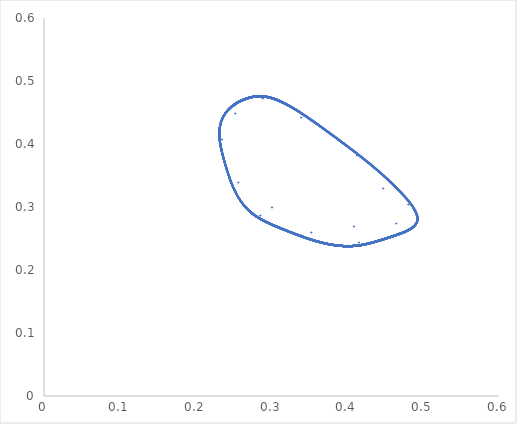
| Category | Series 0 |
|---|---|
| 0.3 | 0.3 |
| 0.408 | 0.27 |
| 0.4466784000000001 | 0.33 |
| 0.3384309997608959 | 0.443 |
| 0.2516668246737154 | 0.45 |
| 0.2555927256868969 | 0.339 |
| 0.3518976219225561 | 0.26 |
| 0.4639900670035131 | 0.275 |
| 0.412085344887821 | 0.383 |
| 0.28779725564910913 | 0.473 |
| 0.23418545066039678 | 0.408 |
| 0.28468329679281196 | 0.287 |
| 0.4147357089099985 | 0.245 |
| 0.4798453995458387 | 0.305 |
| 0.35135039913136556 | 0.439 |
| 0.2507247554830299 | 0.462 |
| 0.24448082575778693 | 0.348 |
| 0.33885452554210405 | 0.255 |
| 0.46776044034405506 | 0.259 |
| 0.4339731850717641 | 0.364 |
| 0.2981450010214707 | 0.474 |
| 0.23112478068429274 | 0.424 |
| 0.27114486434297075 | 0.294 |
| 0.4010068952705898 | 0.239 |
| 0.49075982054262485 | 0.288 |
| 0.369862290358846 | 0.423 |
| 0.25998580892242457 | 0.47 |
| 0.23886224164842962 | 0.366 |
| 0.3205637779438777 | 0.263 |
| 0.45434862250992986 | 0.253 |
| 0.4528372774387154 | 0.344 |
| 0.3125131402679152 | 0.468 |
| 0.23366070986730772 | 0.438 |
| 0.2605501988998789 | 0.307 |
| 0.3828351144710521 | 0.24 |
| 0.4906779546914901 | 0.276 |
| 0.3894758445022503 | 0.406 |
| 0.27072312014614286 | 0.474 |
| 0.23453008102804954 | 0.385 |
| 0.3031020849666783 | 0.271 |
| 0.4387696083859256 | 0.247 |
| 0.4694544361269472 | 0.325 |
| 0.32883389766915255 | 0.457 |
| 0.23938560634832237 | 0.451 |
| 0.25209307293817873 | 0.324 |
| 0.3635044380830901 | 0.245 |
| 0.4839946138672994 | 0.267 |
| 0.4096717942106105 | 0.388 |
| 0.28215908881741564 | 0.477 |
| 0.23147204393836693 | 0.403 |
| 0.28736067747542204 | 0.28 |
| 0.42257819067260705 | 0.241 |
| 0.4826547100077935 | 0.306 |
| 0.3465838779469759 | 0.443 |
| 0.24761172613914673 | 0.461 |
| 0.2453900734821034 | 0.342 |
| 0.3439343950205124 | 0.252 |
| 0.4724467308011112 | 0.26 |
| 0.4296701437162127 | 0.369 |
| 0.29470026997704285 | 0.475 |
| 0.23062419046107321 | 0.42 |
| 0.2739030594202963 | 0.291 |
| 0.40553668158965145 | 0.239 |
| 0.4903780204516413 | 0.291 |
| 0.36526622880386134 | 0.427 |
| 0.2574534633441935 | 0.468 |
| 0.2399932638556005 | 0.362 |
| 0.3249644828907604 | 0.26 |
| 0.458060165290946 | 0.254 |
| 0.4485681247467065 | 0.349 |
| 0.3088454506194812 | 0.47 |
| 0.23269751858967294 | 0.435 |
| 0.2628620100584735 | 0.304 |
| 0.38736699146524084 | 0.24 |
| 0.4914309456426156 | 0.278 |
| 0.3847053179308661 | 0.41 |
| 0.2680883813504671 | 0.474 |
| 0.2354759276895789 | 0.381 |
| 0.30715390935375275 | 0.269 |
| 0.4425666669082542 | 0.248 |
| 0.465716179885406 | 0.329 |
| 0.3247714268165605 | 0.46 |
| 0.23775876635345672 | 0.448 |
| 0.25394729299491337 | 0.32 |
| 0.3681930559576184 | 0.243 |
| 0.4861070701963344 | 0.269 |
| 0.404811734668896 | 0.392 |
| 0.2793379263756787 | 0.476 |
| 0.2320418391116009 | 0.399 |
| 0.2909431357875018 | 0.278 |
| 0.4265222939695723 | 0.243 |
| 0.47991425306738167 | 0.31 |
| 0.3422286901413084 | 0.447 |
| 0.2454544875839503 | 0.459 |
| 0.2468571186857455 | 0.338 |
| 0.34859928385873995 | 0.25 |
| 0.4755555642254959 | 0.262 |
| 0.4249488329168767 | 0.373 |
| 0.291563886345551 | 0.476 |
| 0.23057681449506146 | 0.416 |
| 0.2769030471888592 | 0.288 |
| 0.40971823157012743 | 0.239 |
| 0.48911738876295063 | 0.294 |
| 0.360719760757462 | 0.431 |
| 0.255000047260184 | 0.467 |
| 0.24119679997946974 | 0.357 |
| 0.3294208112536228 | 0.258 |
| 0.46165640539793834 | 0.255 |
| 0.44417324008085507 | 0.354 |
| 0.30529228842900047 | 0.471 |
| 0.23192221132609928 | 0.432 |
| 0.2653014447829947 | 0.3 |
| 0.39182624274696787 | 0.239 |
| 0.49178907270600386 | 0.281 |
| 0.37997605709110854 | 0.415 |
| 0.265488227789007 | 0.473 |
| 0.2364818672928516 | 0.376 |
| 0.31129624522935606 | 0.267 |
| 0.4463327977616989 | 0.249 |
| 0.4618115178498293 | 0.334 |
| 0.32079880828127627 | 0.463 |
| 0.23628620696444655 | 0.445 |
| 0.2559071304657914 | 0.316 |
| 0.3728556109808632 | 0.242 |
| 0.48791412135486095 | 0.271 |
| 0.39995513339910516 | 0.397 |
| 0.276572112377158 | 0.476 |
| 0.23272511737911983 | 0.395 |
| 0.29465191360899334 | 0.276 |
| 0.4304231062088804 | 0.244 |
| 0.47688413442297256 | 0.315 |
| 0.33793153169172196 | 0.45 |
| 0.2434045424794303 | 0.456 |
| 0.24840731025264515 | 0.333 |
| 0.3532892510604819 | 0.248 |
| 0.4784712528277246 | 0.263 |
| 0.4201727585256485 | 0.378 |
| 0.28851518078587074 | 0.476 |
| 0.23069451416088063 | 0.412 |
| 0.28004598751610565 | 0.285 |
| 0.4138354771146103 | 0.24 |
| 0.48747312964861317 | 0.298 |
| 0.35621556059121695 | 0.435 |
| 0.2525975782001791 | 0.465 |
| 0.24245210051270213 | 0.352 |
| 0.3339390572401689 | 0.256 |
| 0.46517702876518985 | 0.257 |
| 0.4396884921597246 | 0.358 |
| 0.30184330255816844 | 0.473 |
| 0.23132212878644842 | 0.428 |
| 0.2678675856624555 | 0.297 |
| 0.39622129762309255 | 0.239 |
| 0.4917673495755245 | 0.284 |
| 0.3752909027568115 | 0.419 |
| 0.26291940901232924 | 0.471 |
| 0.2375388250102545 | 0.372 |
| 0.315522340850996 | 0.265 |
| 0.4500695611999221 | 0.251 |
| 0.4577651404543287 | 0.339 |
| 0.316921353988557 | 0.465 |
| 0.23497374723169043 | 0.442 |
| 0.2579757891858659 | 0.312 |
| 0.37748219997403265 | 0.241 |
| 0.4893979149831432 | 0.273 |
| 0.3951149512785508 | 0.401 |
| 0.2738543870403149 | 0.475 |
| 0.23350664089734036 | 0.391 |
| 0.29847848461400545 | 0.274 |
| 0.43428603175662644 | 0.245 |
| 0.4735962931818137 | 0.319 |
| 0.3336999283145049 | 0.453 |
| 0.24147561855189478 | 0.454 |
| 0.25004752821479204 | 0.329 |
| 0.3579921754561107 | 0.247 |
| 0.48116323504643244 | 0.265 |
| 0.4153546225075041 | 0.382 |
| 0.28554689638749076 | 0.477 |
| 0.23096820752949465 | 0.408 |
| 0.2833314903205086 | 0.283 |
| 0.4178924372831076 | 0.24 |
| 0.4854591689693709 | 0.301 |
| 0.3517545781424127 | 0.439 |
| 0.2502574878136701 | 0.463 |
| 0.24376565765255062 | 0.348 |
| 0.3385127921669486 | 0.254 |
| 0.46859867905128755 | 0.258 |
| 0.435120740592847 | 0.363 |
| 0.29849689291313414 | 0.474 |
| 0.23089817897345283 | 0.424 |
| 0.27056566654808906 | 0.294 |
| 0.4005494150178268 | 0.239 |
| 0.4913577286941175 | 0.287 |
| 0.37065038655563304 | 0.423 |
| 0.2603825161647846 | 0.47 |
| 0.23864226412899117 | 0.367 |
| 0.3198264025731898 | 0.263 |
| 0.45377279371139273 | 0.252 |
| 0.45359520503409895 | 0.343 |
| 0.3131434663441369 | 0.467 |
| 0.23382652617623656 | 0.439 |
| 0.2601568203153708 | 0.308 |
| 0.3820637352324987 | 0.24 |
| 0.4905419318178488 | 0.275 |
| 0.390301966743441 | 0.405 |
| 0.2711785493651791 | 0.475 |
| 0.23437199927404567 | 0.386 |
| 0.3024138502064652 | 0.271 |
| 0.43811554984957796 | 0.246 |
| 0.4700825209469463 | 0.324 |
| 0.3295418464102805 | 0.457 |
| 0.23968001228183872 | 0.451 |
| 0.251783616281448 | 0.325 |
| 0.36269551102360864 | 0.245 |
| 0.48360288925872164 | 0.267 |
| 0.4105085254008296 | 0.387 |
| 0.28265113584945084 | 0.477 |
| 0.23138628404811662 | 0.404 |
| 0.28675676257693367 | 0.281 |
| 0.4218941114131488 | 0.241 |
| 0.48309562132238 | 0.305 |
| 0.34733954673316747 | 0.443 |
| 0.2479931120515237 | 0.461 |
| 0.24514514375087987 | 0.343 |
| 0.34313410771736574 | 0.252 |
| 0.471893992335971 | 0.26 |
| 0.4304772092250973 | 0.368 |
| 0.2952499323402746 | 0.475 |
| 0.2306495114291169 | 0.421 |
| 0.2734005403456522 | 0.291 |
| 0.4048095744681369 | 0.239 |
| 0.49055584644234107 | 0.29 |
| 0.3660537909969593 | 0.427 |
| 0.25788059183331413 | 0.469 |
| 0.23979077110878058 | 0.363 |
| 0.3242033885665147 | 0.261 |
| 0.4574343953899824 | 0.254 |
| 0.4493156747615447 | 0.348 |
| 0.30946814941551715 | 0.469 |
| 0.23284864124205354 | 0.436 |
| 0.2624541541616523 | 0.304 |
| 0.3865925526370939 | 0.24 |
| 0.4913316374152372 | 0.278 |
| 0.38552439423093326 | 0.41 |
| 0.268539590372972 | 0.474 |
| 0.2353082832899045 | 0.382 |
| 0.3064491973339357 | 0.269 |
| 0.4419149764499867 | 0.248 |
| 0.4663729924687215 | 0.328 |
| 0.3254650510208979 | 0.459 |
| 0.2380281786823699 | 0.449 |
| 0.25362038170877693 | 0.32 |
| 0.36738688799693625 | 0.244 |
| 0.48576445086383885 | 0.269 |
| 0.4056491862417289 | 0.391 |
| 0.27981979597855394 | 0.476 |
| 0.23193514577450905 | 0.4 |
| 0.29031670761907163 | 0.278 |
| 0.42584604905578166 | 0.242 |
| 0.4804079267066945 | 0.31 |
| 0.3429750731393446 | 0.446 |
| 0.2458188895419321 | 0.459 |
| 0.2465986482664254 | 0.339 |
| 0.3477934903103921 | 0.25 |
| 0.4750328704712012 | 0.261 |
| 0.4257664666462856 | 0.372 |
| 0.2920977913946692 | 0.476 |
| 0.2305729945633767 | 0.417 |
| 0.2763760320106652 | 0.288 |
| 0.4090025005205697 | 0.239 |
| 0.48936221823056714 | 0.293 |
| 0.3615000286691148 | 0.431 |
| 0.25541937983184254 | 0.467 |
| 0.24098591599773633 | 0.358 |
| 0.32864848719977213 | 0.259 |
| 0.4610416451872665 | 0.255 |
| 0.44493700847053114 | 0.353 |
| 0.30589698814675703 | 0.471 |
| 0.23204333665893012 | 0.432 |
| 0.26487228338951563 | 0.301 |
| 0.39106246531175165 | 0.239 |
| 0.49175418842377683 | 0.28 |
| 0.38078772482006457 | 0.414 |
| 0.26593393831211465 | 0.473 |
| 0.23630474995123 | 0.377 |
| 0.3105764426914663 | 0.267 |
| 0.44568598733533454 | 0.249 |
| 0.46249490176178526 | 0.333 |
| 0.32147658090532105 | 0.462 |
| 0.23652865054148803 | 0.446 |
| 0.25556182098814484 | 0.316 |
| 0.37205462254728167 | 0.242 |
| 0.4876253506581168 | 0.271 |
| 0.400791007861758 | 0.396 |
| 0.2770449977418507 | 0.476 |
| 0.23259997832874585 | 0.396 |
| 0.29400430842093844 | 0.276 |
| 0.42975390250641204 | 0.244 |
| 0.47742544291426003 | 0.314 |
| 0.3386674039245774 | 0.45 |
| 0.24374945192781453 | 0.457 |
| 0.24813399905710834 | 0.334 |
| 0.35247997902883066 | 0.249 |
| 0.4779840458967182 | 0.263 |
| 0.4209989690206218 | 0.377 |
| 0.28903447414170536 | 0.476 |
| 0.23066282672684119 | 0.413 |
| 0.2794943065181793 | 0.286 |
| 0.41313057083726734 | 0.24 |
| 0.4877832370664043 | 0.297 |
| 0.3569885237797014 | 0.435 |
| 0.2530073816863911 | 0.465 |
| 0.24223188005874718 | 0.353 |
| 0.33315648758063143 | 0.257 |
| 0.46457683460618193 | 0.257 |
| 0.44046724534819176 | 0.358 |
| 0.3024301264152882 | 0.473 |
| 0.2314129603134553 | 0.429 |
| 0.2674162202315003 | 0.298 |
| 0.3954688223527438 | 0.239 |
| 0.49179856555496443 | 0.283 |
| 0.3760948866270867 | 0.418 |
| 0.26335974231336345 | 0.472 |
| 0.23735332848328128 | 0.373 |
| 0.31478854800002987 | 0.265 |
| 0.44942800952730366 | 0.251 |
| 0.4584715222238514 | 0.338 |
| 0.31758237919585436 | 0.465 |
| 0.23518820837364557 | 0.443 |
| 0.2576114844653053 | 0.312 |
| 0.376688094410552 | 0.241 |
| 0.4891660765587024 | 0.273 |
| 0.3959471624940304 | 0.4 |
| 0.2743194593126028 | 0.475 |
| 0.23336563372378638 | 0.391 |
| 0.2978112225657388 | 0.274 |
| 0.43362300976526275 | 0.245 |
| 0.4741797150766892 | 0.318 |
| 0.3344239420606182 | 0.453 |
| 0.24179875409495186 | 0.454 |
| 0.24975825989559455 | 0.33 |
| 0.35718156192234657 | 0.247 |
| 0.48071667904510623 | 0.265 |
| 0.4161871046297308 | 0.382 |
| 0.2860528850970187 | 0.477 |
| 0.230910407662772 | 0.409 |
| 0.2827553799711845 | 0.283 |
| 0.4171975828842945 | 0.24 |
| 0.4858317005897444 | 0.301 |
| 0.35251995350694065 | 0.438 |
| 0.2506556375048489 | 0.464 |
| 0.24353487653906508 | 0.349 |
| 0.33772118215916824 | 0.255 |
| 0.46801738961249073 | 0.258 |
| 0.4359133035269886 | 0.362 |
| 0.29906622487720796 | 0.474 |
| 0.2309586705310063 | 0.425 |
| 0.2700912055392229 | 0.295 |
| 0.399808593451067 | 0.239 |
| 0.49145620200565654 | 0.286 |
| 0.3714467071552664 | 0.422 |
| 0.2608172044768977 | 0.47 |
| 0.23844894697317429 | 0.368 |
| 0.31907955225945817 | 0.263 |
| 0.45313747681378963 | 0.252 |
| 0.45432176749779857 | 0.343 |
| 0.3137870843784553 | 0.467 |
| 0.2340122018175233 | 0.439 |
| 0.25977288950303845 | 0.309 |
| 0.3812779785668302 | 0.24 |
| 0.4903697171305539 | 0.275 |
| 0.39112883135295334 | 0.405 |
| 0.27163679846752004 | 0.475 |
| 0.23421752032812293 | 0.387 |
| 0.30172848621497617 | 0.272 |
| 0.4374580090888158 | 0.246 |
| 0.47070265095653735 | 0.323 |
| 0.33025262695303853 | 0.456 |
| 0.23997938008756448 | 0.452 |
| 0.2514774614083825 | 0.325 |
| 0.36188572063040153 | 0.245 |
| 0.48320172893494096 | 0.266 |
| 0.4113447809400602 | 0.386 |
| 0.28314520765038614 | 0.477 |
| 0.23130453246261265 | 0.405 |
| 0.286156874999424 | 0.281 |
| 0.4212083957082331 | 0.241 |
| 0.4835266998310653 | 0.305 |
| 0.34809672793407076 | 0.442 |
| 0.24837720728229842 | 0.462 |
| 0.2449024296607858 | 0.344 |
| 0.342334934470055 | 0.253 |
| 0.47133655738903996 | 0.26 |
| 0.4312822638606502 | 0.367 |
| 0.29580242016739405 | 0.475 |
| 0.23067995848471726 | 0.421 |
| 0.2729022024081481 | 0.292 |
| 0.4040804574410254 | 0.239 |
| 0.4907220135017007 | 0.289 |
| 0.3668426236298652 | 0.426 |
| 0.2583089234407624 | 0.469 |
| 0.2395896572342336 | 0.363 |
| 0.3234443163626163 | 0.261 |
| 0.4568070221029084 | 0.253 |
| 0.450060287209393 | 0.347 |
| 0.31009394354067643 | 0.469 |
| 0.23300488894506544 | 0.436 |
| 0.26204988253327477 | 0.305 |
| 0.3858163612631242 | 0.24 |
| 0.4912214263464763 | 0.277 |
| 0.3863446908373554 | 0.409 |
| 0.2689917839422417 | 0.474 |
| 0.23514241877732137 | 0.382 |
| 0.30574721037615366 | 0.27 |
| 0.44126244782856794 | 0.247 |
| 0.46702481138691165 | 0.328 |
| 0.3261612995436605 | 0.459 |
| 0.23830211593464268 | 0.449 |
| 0.2532965783891608 | 0.321 |
| 0.3665800156747216 | 0.244 |
| 0.48541289997537584 | 0.268 |
| 0.4064866752705094 | 0.391 |
| 0.2803033423637438 | 0.476 |
| 0.23183189542199908 | 0.401 |
| 0.28969407167198236 | 0.279 |
| 0.4251684964215117 | 0.242 |
| 0.4808928452993853 | 0.309 |
| 0.3437231393535317 | 0.446 |
| 0.246186403348298 | 0.46 |
| 0.24634260907187666 | 0.339 |
| 0.34698850388013236 | 0.251 |
| 0.4745046043289046 | 0.261 |
| 0.42658241101818684 | 0.372 |
| 0.292634335533663 | 0.476 |
| 0.2305741189309441 | 0.418 |
| 0.2758532600679798 | 0.289 |
| 0.40828484101112106 | 0.239 |
| 0.4895955942923556 | 0.293 |
| 0.36228154774864635 | 0.43 |
| 0.25584016694887246 | 0.467 |
| 0.2407765354776817 | 0.359 |
| 0.32787803260588544 | 0.259 |
| 0.46042475798595767 | 0.255 |
| 0.44569807566258546 | 0.352 |
| 0.3065047871817033 | 0.471 |
| 0.2321696569033623 | 0.433 |
| 0.2644468555249377 | 0.301 |
| 0.3902967975684969 | 0.239 |
| 0.49170807365237923 | 0.28 |
| 0.381600698644301 | 0.413 |
| 0.26638057757485106 | 0.473 |
| 0.23612917210266485 | 0.378 |
| 0.3098591562376774 | 0.268 |
| 0.445038323642785 | 0.249 |
| 0.46317398393094666 | 0.332 |
| 0.3221571547209518 | 0.462 |
| 0.23677581945646542 | 0.446 |
| 0.2552197238212548 | 0.317 |
| 0.37125261400158627 | 0.243 |
| 0.4873270704768902 | 0.27 |
| 0.40162731260748225 | 0.395 |
| 0.27751934303113596 | 0.476 |
| 0.23247783048321136 | 0.396 |
| 0.29336024611132183 | 0.276 |
| 0.42908355044088065 | 0.243 |
| 0.47795893711655996 | 0.313 |
| 0.3394051806317523 | 0.449 |
| 0.24409788911980815 | 0.457 |
| 0.24786332939827094 | 0.335 |
| 0.3516711562415631 | 0.249 |
| 0.4774903478635081 | 0.263 |
| 0.4218238588918033 | 0.376 |
| 0.2895561950572541 | 0.476 |
| 0.23063582785356504 | 0.414 |
| 0.2789468698374146 | 0.286 |
| 0.41242384969143037 | 0.24 |
| 0.48808227119101644 | 0.296 |
| 0.35776275706088595 | 0.434 |
| 0.2534189686655786 | 0.466 |
| 0.24201334924687076 | 0.354 |
| 0.33237560419997064 | 0.257 |
| 0.46397384176157136 | 0.256 |
| 0.4412434995226284 | 0.357 |
| 0.3030200099512591 | 0.472 |
| 0.23150902232342413 | 0.429 |
| 0.26696874512880114 | 0.298 |
| 0.39471436659934406 | 0.239 |
| 0.4918182942195645 | 0.283 |
| 0.376900199419343 | 0.417 |
| 0.26380100950061675 | 0.472 |
| 0.23716922060025272 | 0.373 |
| 0.31405709493202344 | 0.266 |
| 0.44878550072650897 | 0.25 |
| 0.45917416339862616 | 0.337 |
| 0.3182463434590064 | 0.464 |
| 0.23540755277863912 | 0.443 |
| 0.25725049555596985 | 0.313 |
| 0.3758926916963489 | 0.242 |
| 0.4889242280667688 | 0.272 |
| 0.3967801371166067 | 0.4 |
| 0.274785801487212 | 0.476 |
| 0.2332271826804883 | 0.392 |
| 0.29714723562866485 | 0.274 |
| 0.4329589779984795 | 0.245 |
| 0.4747562739067616 | 0.318 |
| 0.3351500974912075 | 0.452 |
| 0.24212579192885533 | 0.455 |
| 0.24947181215523284 | 0.33 |
| 0.35637102463308923 | 0.247 |
| 0.4802627676607248 | 0.264 |
| 0.4170186807740337 | 0.381 |
| 0.2865610682852051 | 0.476 |
| 0.23085696254507204 | 0.41 |
| 0.2821834432502894 | 0.284 |
| 0.4165010589010216 | 0.24 |
| 0.48619372745957046 | 0.3 |
| 0.3532866701406544 | 0.438 |
| 0.25105596020872123 | 0.464 |
| 0.24330601027079157 | 0.349 |
| 0.336931032198975 | 0.255 |
| 0.467432504492283 | 0.258 |
| 0.43670357506119856 | 0.361 |
| 0.29963853152396536 | 0.474 |
| 0.2310243787921228 | 0.426 |
| 0.26962078373720955 | 0.295 |
| 0.3990657520742059 | 0.239 |
| 0.4915430341206119 | 0.286 |
| 0.37224433785590927 | 0.421 |
| 0.26125290311697114 | 0.471 |
| 0.2382569608707757 | 0.369 |
| 0.31833489040431356 | 0.264 |
| 0.45250098591461696 | 0.252 |
| 0.4550450226980364 | 0.342 |
| 0.3144337378882193 | 0.466 |
| 0.23420288654380275 | 0.44 |
| 0.25939238812619225 | 0.309 |
| 0.3804906897402214 | 0.241 |
| 0.49018705263657 | 0.275 |
| 0.3919567174168679 | 0.404 |
| 0.2720961616345143 | 0.475 |
| 0.23406520347800017 | 0.388 |
| 0.30104613208511194 | 0.272 |
| 0.4367995649239027 | 0.246 |
| 0.4713168284524925 | 0.322 |
| 0.3309657832451418 | 0.456 |
| 0.24028297063001003 | 0.452 |
| 0.2511742742865254 | 0.326 |
| 0.36107563597213616 | 0.246 |
| 0.482792431717345 | 0.266 |
| 0.412180568412794 | 0.385 |
| 0.28364123246414147 | 0.477 |
| 0.23122673888161957 | 0.406 |
| 0.2855610201230645 | 0.281 |
| 0.4205211743780631 | 0.241 |
| 0.4839480073206473 | 0.304 |
| 0.3488553782632248 | 0.441 |
| 0.24876390254818076 | 0.462 |
| 0.24466187164762576 | 0.345 |
| 0.3415369467173338 | 0.253 |
| 0.47077464046404716 | 0.259 |
| 0.4320852714702487 | 0.366 |
| 0.2963577525041468 | 0.475 |
| 0.23071554300715896 | 0.422 |
| 0.27240802545309534 | 0.292 |
| 0.403349333423052 | 0.239 |
| 0.4908765246956564 | 0.289 |
| 0.3676327318750548 | 0.425 |
| 0.25873842146759307 | 0.469 |
| 0.23938990716163866 | 0.364 |
| 0.32268729145244246 | 0.262 |
| 0.4561781230837338 | 0.253 |
| 0.45080191619897053 | 0.346 |
| 0.31072282751052266 | 0.469 |
| 0.23316624625615653 | 0.437 |
| 0.2616491706918269 | 0.306 |
| 0.3850384463105342 | 0.24 |
| 0.4911003756492644 | 0.277 |
| 0.38716618547392845 | 0.408 |
| 0.26944497699999875 | 0.474 |
| 0.23497838391619721 | 0.383 |
| 0.3050479878566731 | 0.27 |
| 0.4406090764908168 | 0.247 |
| 0.4676715050391599 | 0.327 |
| 0.32686013832915584 | 0.458 |
| 0.23858053848848013 | 0.45 |
| 0.2529758640395084 | 0.322 |
| 0.3657724968919645 | 0.244 |
| 0.4850525261095018 | 0.268 |
| 0.40732412962861375 | 0.39 |
| 0.28078860497707625 | 0.476 |
| 0.23173216563782933 | 0.401 |
| 0.28907526746316947 | 0.279 |
| 0.4244896073387982 | 0.242 |
| 0.48136885183516553 | 0.308 |
| 0.34447285368339126 | 0.445 |
| 0.246556954596528 | 0.46 |
| 0.24608896218399817 | 0.34 |
| 0.34618438344574337 | 0.251 |
| 0.47397092671127344 | 0.261 |
| 0.4273966082550879 | 0.371 |
| 0.293173552153308 | 0.476 |
| 0.23058022319726518 | 0.418 |
| 0.2753347243416862 | 0.289 |
| 0.4075652375107267 | 0.239 |
| 0.4898174710365496 | 0.292 |
| 0.3630643190944684 | 0.429 |
| 0.25626235932646846 | 0.468 |
| 0.24056863191757158 | 0.36 |
| 0.3271094755425656 | 0.259 |
| 0.4598058451005028 | 0.255 |
| 0.44645640459199376 | 0.351 |
| 0.3071156878742161 | 0.47 |
| 0.2323011620761807 | 0.433 |
| 0.26402513457881105 | 0.302 |
| 0.38952925998937826 | 0.239 |
| 0.49165078059837547 | 0.28 |
| 0.38241496876631775 | 0.412 |
| 0.2668281511326395 | 0.473 |
| 0.23595516897273003 | 0.379 |
| 0.30914441945528076 | 0.268 |
| 0.4443898149584725 | 0.249 |
| 0.46384865431828093 | 0.331 |
| 0.3228405019217493 | 0.461 |
| 0.23702768251414263 | 0.447 |
| 0.25488082139316365 | 0.318 |
| 0.3704496371205924 | 0.243 |
| 0.4870193743988954 | 0.27 |
| 0.40246398366348457 | 0.394 |
| 0.277995183915015 | 0.476 |
| 0.2323587512084731 | 0.397 |
| 0.2927197715580372 | 0.277 |
| 0.42841202373077175 | 0.243 |
| 0.4784844526976893 | 0.312 |
| 0.34014482201098184 | 0.448 |
| 0.24444978486361715 | 0.458 |
| 0.24759526714499866 | 0.336 |
| 0.3508628459238932 | 0.249 |
| 0.47699031413537835 | 0.262 |
| 0.4226473608355643 | 0.375 |
| 0.29008038186220236 | 0.476 |
| 0.23061356745540507 | 0.414 |
| 0.27840368230855894 | 0.287 |
| 0.4117152915087984 | 0.239 |
| 0.4883701527477001 | 0.296 |
| 0.3585382537297108 | 0.433 |
| 0.25383227760385657 | 0.466 |
| 0.24179647258071643 | 0.355 |
| 0.3315964414511591 | 0.257 |
| 0.46336817567551397 | 0.256 |
| 0.44201722048265724 | 0.356 |
| 0.30361296320128156 | 0.472 |
| 0.23161031175599023 | 0.43 |
| 0.2665251334124279 | 0.299 |
| 0.3939579423421637 | 0.239 |
| 0.49182657345787284 | 0.282 |
| 0.3777068408421771 | 0.417 |
| 0.2642432048846696 | 0.472 |
| 0.23698652072379353 | 0.374 |
| 0.3133280099212791 | 0.266 |
| 0.448142060071698 | 0.25 |
| 0.45987297670087623 | 0.336 |
| 0.3189132259480562 | 0.464 |
| 0.23563175579363535 | 0.444 |
| 0.2568928041695093 | 0.314 |
| 0.37509603662278296 | 0.242 |
| 0.48867245097824147 | 0.272 |
| 0.39761382278776963 | 0.399 |
| 0.2752534440575448 | 0.476 |
| 0.23309136043324752 | 0.393 |
| 0.2964865703100857 | 0.275 |
| 0.4322939145438633 | 0.244 |
| 0.4753258073517724 | 0.317 |
| 0.33587835345098155 | 0.452 |
| 0.2424566711420554 | 0.455 |
| 0.2491881564944126 | 0.331 |
| 0.35556062815494743 | 0.248 |
| 0.4798016444890308 | 0.264 |
| 0.4178492771199215 | 0.38 |
| 0.2870714870815946 | 0.476 |
| 0.23080793470197858 | 0.41 |
| 0.2816156975034307 | 0.284 |
| 0.4158028385938914 | 0.24 |
| 0.4865451389632335 | 0.299 |
| 0.35405471173020797 | 0.437 |
| 0.251458385426055 | 0.464 |
| 0.2430790182723101 | 0.35 |
| 0.33614238467143187 | 0.255 |
| 0.46684416853641914 | 0.258 |
| 0.43749151754139576 | 0.361 |
| 0.3002138307551881 | 0.473 |
| 0.2310953103637351 | 0.426 |
| 0.2691543768653915 | 0.296 |
| 0.3983208939479838 | 0.239 |
| 0.49161824263401044 | 0.285 |
| 0.3730432837750486 | 0.421 |
| 0.26168959342021536 | 0.471 |
| 0.2380663091318989 | 0.37 |
| 0.31759244186987867 | 0.264 |
| 0.4518633674578301 | 0.251 |
| 0.4557649044804254 | 0.341 |
| 0.3150834132524164 | 0.466 |
| 0.23439856059883488 | 0.441 |
| 0.2590152955266892 | 0.31 |
| 0.37970190616819494 | 0.241 |
| 0.48999401035785134 | 0.274 |
| 0.39278558622970416 | 0.403 |
| 0.272556662976612 | 0.475 |
| 0.23391511273477045 | 0.388 |
| 0.3003668325146794 | 0.273 |
| 0.43614020187044295 | 0.246 |
| 0.4719249014521707 | 0.321 |
| 0.3316812759496647 | 0.455 |
| 0.2405907328351198 | 0.453 |
| 0.25087403164721667 | 0.327 |
| 0.3602653199757219 | 0.246 |
| 0.4823751255918381 | 0.266 |
| 0.4130158118944069 | 0.385 |
| 0.28413925190743244 | 0.477 |
| 0.23115297524684983 | 0.406 |
| 0.2849692268926942 | 0.282 |
| 0.41983241843441377 | 0.241 |
| 0.48435940716465553 | 0.303 |
| 0.3496154717751464 | 0.441 |
| 0.2491531227644459 | 0.462 |
| 0.24442342797016384 | 0.346 |
| 0.3407401951655079 | 0.253 |
| 0.47020839869572584 | 0.259 |
| 0.4328861863309997 | 0.365 |
| 0.296915954903005 | 0.475 |
| 0.23075628394862963 | 0.423 |
| 0.2719179913032904 | 0.293 |
| 0.40261619652111275 | 0.239 |
| 0.4910193711122766 | 0.288 |
| 0.3684241216063892 | 0.425 |
| 0.2591690531185196 | 0.469 |
| 0.2391915091508978 | 0.365 |
| 0.3219323382252188 | 0.262 |
| 0.45554776927751256 | 0.253 |
| 0.4515405125402206 | 0.346 |
| 0.31135479497071145 | 0.468 |
| 0.23333269755730568 | 0.437 |
| 0.26125199489087875 | 0.306 |
| 0.38425883759051277 | 0.24 |
| 0.4909685490578674 | 0.277 |
| 0.387988853512909 | 0.407 |
| 0.26989918601134494 | 0.474 |
| 0.23481623083479855 | 0.384 |
| 0.3043515700746192 | 0.27 |
| 0.43995485593181055 | 0.247 |
| 0.46831293834322407 | 0.326 |
| 0.3275615323935736 | 0.458 |
| 0.23886340513996868 | 0.45 |
| 0.2526582192109618 | 0.322 |
| 0.36496439044137535 | 0.244 |
| 0.48468344059322394 | 0.268 |
| 0.40816147621488846 | 0.389 |
| 0.2812756237531605 | 0.477 |
| 0.2316360335761566 | 0.402 |
| 0.28846033322391795 | 0.279 |
| 0.42380935285230853 | 0.242 |
| 0.4818357915171526 | 0.307 |
| 0.3452241821556062 | 0.444 |
| 0.2469304683859553 | 0.46 |
| 0.2458376680412886 | 0.341 |
| 0.3453811868620938 | 0.251 |
| 0.4734319986996024 | 0.261 |
| 0.4282090023746814 | 0.37 |
| 0.2937154736098386 | 0.475 |
| 0.23059134044940563 | 0.419 |
| 0.27482041594653106 | 0.29 |
| 0.4068436758025011 | 0.239 |
| 0.49002780824267533 | 0.292 |
| 0.3638483448461568 | 0.429 |
| 0.25668591001342084 | 0.468 |
| 0.24036218072779764 | 0.36 |
| 0.3263428432641084 | 0.26 |
| 0.4591850034141833 | 0.254 |
| 0.4472119570000548 | 0.35 |
| 0.307729691266831 | 0.47 |
| 0.23243784123538677 | 0.434 |
| 0.26360709423471856 | 0.303 |
| 0.38875987445771704 | 0.239 |
| 0.49158236343908607 | 0.279 |
| 0.3832305234124284 | 0.412 |
| 0.2672766662926186 | 0.473 |
| 0.23578277841954431 | 0.379 |
| 0.3084322669371973 | 0.268 |
| 0.44374046705331965 | 0.248 |
| 0.46451879900006665 | 0.331 |
| 0.32352659355526037 | 0.461 |
| 0.23728420719903867 | 0.447 |
| 0.2545450960457611 | 0.318 |
| 0.36964574481388 | 0.243 |
| 0.48670235840229414 | 0.27 |
| 0.4033009553703405 | 0.394 |
| 0.27847255682286676 | 0.476 |
| 0.23224281823820173 | 0.398 |
| 0.29208292898048105 | 0.277 |
| 0.42773929553446427 | 0.243 |
| 0.47900182590668844 | 0.312 |
| 0.34088628883513056 | 0.448 |
| 0.2448050688120401 | 0.458 |
| 0.24732977724480112 | 0.336 |
| 0.3500551107587112 | 0.25 |
| 0.47648410157787857 | 0.262 |
| 0.4234694090268421 | 0.375 |
| 0.29060707217784876 | 0.476 |
| 0.23059609305520842 | 0.415 |
| 0.27786474663395655 | 0.287 |
| 0.4110048751293773 | 0.239 |
| 0.48864680816439954 | 0.295 |
| 0.3593150086025793 | 0.433 |
| 0.2542472488825053 | 0.466 |
| 0.24158121584314576 | 0.356 |
| 0.3308190324428522 | 0.258 |
| 0.46275995789263724 | 0.256 |
| 0.4427883740169589 | 0.355 |
| 0.3042089948565102 | 0.472 |
| 0.23171682417353942 | 0.431 |
| 0.2660853580054687 | 0.299 |
| 0.39319956305972265 | 0.239 |
| 0.49182344401993494 | 0.282 |
| 0.37851480923347375 | 0.416 |
| 0.26468632484427057 | 0.472 |
| 0.23680525099481461 | 0.375 |
| 0.31260132205842633 | 0.266 |
| 0.44749770960327534 | 0.25 |
| 0.4605678709721842 | 0.335 |
| 0.31958300460465106 | 0.463 |
| 0.23586079177120498 | 0.444 |
| 0.25653839227856806 | 0.314 |
| 0.374298175222083 | 0.242 |
| 0.4884108286385448 | 0.272 |
| 0.3984481649597319 | 0.398 |
| 0.2757224184971587 | 0.476 |
| 0.23295824075747237 | 0.394 |
| 0.2958292730974964 | 0.275 |
| 0.4316277965978391 | 0.244 |
| 0.47588815211229146 | 0.316 |
| 0.3366086687796933 | 0.451 |
| 0.24279132924128702 | 0.456 |
| 0.24890726343944045 | 0.332 |
| 0.35475043704344156 | 0.248 |
| 0.4793334555079768 | 0.264 |
| 0.4186788206829514 | 0.379 |
| 0.2875841822977955 | 0.476 |
| 0.23076338467774113 | 0.411 |
| 0.2810521579426189 | 0.285 |
| 0.41510289584837856 | 0.24 |
| 0.48688582958933985 | 0.299 |
| 0.3548240636689741 | 0.436 |
| 0.2518628439125565 | 0.465 |
| 0.24285386055666508 | 0.351 |
| 0.33535528051451324 | 0.256 |
| 0.466252523701092 | 0.257 |
| 0.4382770942969408 | 0.36 |
| 0.3007921391181522 | 0.473 |
| 0.23117146998344698 | 0.427 |
| 0.26869195994697315 | 0.296 |
| 0.3975740236872752 | 0.239 |
| 0.4916818490948264 | 0.285 |
| 0.37384354942310216 | 0.42 |
| 0.262127259063025 | 0.471 |
| 0.2378769977948631 | 0.37 |
| 0.3168522319184466 | 0.264 |
| 0.45122466396567024 | 0.251 |
| 0.4564813432836009 | 0.34 |
| 0.31573609560307536 | 0.466 |
| 0.23459920346871518 | 0.441 |
| 0.25864159153691346 | 0.31 |
| 0.37891166655373343 | 0.241 |
| 0.48979066380434255 | 0.274 |
| 0.39361539665725326 | 0.402 |
| 0.2730183277892411 | 0.475 |
| 0.23376731385273025 | 0.389 |
| 0.29969063272790963 | 0.273 |
| 0.43547990317271207 | 0.245 |
| 0.47252671566687243 | 0.321 |
| 0.3323990652136754 | 0.454 |
| 0.2409026138914439 | 0.453 |
| 0.2505767093973918 | 0.328 |
| 0.3594548360465977 | 0.246 |
| 0.48194994138350944 | 0.265 |
| 0.41385043547450745 | 0.384 |
| 0.28463930767515794 | 0.477 |
| 0.23108331215668956 | 0.407 |
| 0.28438152238482584 | 0.282 |
| 0.41914209910962524 | 0.241 |
| 0.4847607667153882 | 0.303 |
| 0.35037698411031937 | 0.44 |
| 0.2495447932969842 | 0.463 |
| 0.24418705682700453 | 0.346 |
| 0.3399447291326552 | 0.254 |
| 0.4696379876796497 | 0.259 |
| 0.43368496433932213 | 0.365 |
| 0.2974770516391529 | 0.474 |
| 0.23080219797266735 | 0.423 |
| 0.27143208048743017 | 0.293 |
| 0.4018810423606997 | 0.239 |
| 0.4911505488079928 | 0.288 |
| 0.36921679890184095 | 0.424 |
| 0.25960078807237325 | 0.47 |
| 0.23899445393020183 | 0.366 |
| 0.32117948091537046 | 0.262 |
| 0.45491602724021724 | 0.253 |
| 0.4522760245095778 | 0.345 |
| 0.311989838309604 | 0.468 |
| 0.2335042265177948 | 0.438 |
| 0.26085833191582364 | 0.307 |
| 0.38347756624270507 | 0.24 |
| 0.49082601175019147 | 0.276 |
| 0.38881266794320074 | 0.407 |
| 0.270354428857993 | 0.474 |
| 0.23465601390343055 | 0.385 |
| 0.3036579982201187 | 0.271 |
| 0.4392997778868736 | 0.247 |
| 0.46894897293190646 | 0.325 |
| 0.32826544585873596 | 0.457 |
| 0.23915067304125195 | 0.451 |
| 0.2523436239298539 | 0.323 |
| 0.36415575597491656 | 0.245 |
| 0.4843057575865573 | 0.267 |
| 0.4089986410944929 | 0.388 |
| 0.2817644390574169 | 0.477 |
| 0.23154357581879953 | 0.403 |
| 0.28784930579997253 | 0.28 |
| 0.4231277038464401 | 0.242 |
| 0.48229351204463405 | 0.307 |
| 0.34597709200726984 | 0.444 |
| 0.24730686945185779 | 0.461 |
| 0.24558868650794236 | 0.342 |
| 0.3445789708917551 | 0.252 |
| 0.4728879813003873 | 0.26 |
| 0.42901953920341157 | 0.369 |
| 0.29426013117861016 | 0.475 |
| 0.23060750127114485 | 0.42 |
| 0.27431032420033996 | 0.29 |
| 0.4061201430254402 | 0.239 |
| 0.490226571319766 | 0.291 |
| 0.36463362807644434 | 0.428 |
| 0.25711077443612196 | 0.468 |
| 0.24015715932742415 | 0.361 |
| 0.3255781622989158 | 0.26 |
| 0.4585623253499346 | 0.254 |
| 0.4479646932270471 | 0.35 |
| 0.3083467971121214 | 0.47 |
| 0.232579682535562 | 0.435 |
| 0.26319270852456467 | 0.303 |
| 0.3879886642534119 | 0.239 |
| 0.4915028782060124 | 0.279 |
| 0.38404734875058694 | 0.411 |
| 0.26772613206046475 | 0.473 |
| 0.2356120408905177 | 0.38 |
| 0.30772273428812363 | 0.269 |
| 0.4430902833144526 | 0.248 |
| 0.4651843002159148 | 0.33 |
| 0.32421539954796236 | 0.46 |
| 0.2375453596195965 | 0.448 |
| 0.25421252996940025 | 0.319 |
| 0.36884099109483376 | 0.243 |
| 0.48637612093960453 | 0.269 |
| 0.40413816049191714 | 0.393 |
| 0.27895149890076154 | 0.476 |
| 0.23213010953818117 | 0.399 |
| 0.29144976182764865 | 0.278 |
| 0.42706533850673783 | 0.243 |
| 0.4795108938554994 | 0.311 |
| 0.34162954255230554 | 0.447 |
| 0.24516366956141689 | 0.458 |
| 0.24706682375559502 | 0.337 |
| 0.3492480127974574 | 0.25 |
| 0.47597186831454424 | 0.262 |
| 0.4242899392005782 | 0.374 |
| 0.29113630285475006 | 0.476 |
| 0.23058344974190853 | 0.416 |
| 0.2773300634113915 | 0.288 |
| 0.41029258046126416 | 0.239 |
| 0.48891216961386635 | 0.294 |
| 0.3600930179543327 | 0.432 |
| 0.25466382488915135 | 0.467 |
| 0.24136754621207174 | 0.356 |
| 0.3300434090990258 | 0.258 |
| 0.4621493059307902 | 0.256 |
| 0.4435569257072749 | 0.354 |
| 0.3048081122709645 | 0.471 |
| 0.23182855384239354 | 0.431 |
| 0.26564939178218805 | 0.3 |
| 0.3924392437153618 | 0.239 |
| 0.49180894934245006 | 0.281 |
| 0.3793241014422042 | 0.415 |
| 0.2651303677724739 | 0.472 |
| 0.23662543632076521 | 0.376 |
| 0.3118770613009426 | 0.267 |
| 0.44685246825510444 | 0.25 |
| 0.461258751138412 | 0.335 |
| 0.3202556561499806 | 0.463 |
| 0.23609463401629674 | 0.445 |
| 0.25618724206304455 | 0.315 |
| 0.3734991547547638 | 0.242 |
| 0.4881394463540932 | 0.271 |
| 0.3992831069642821 | 0.397 |
| 0.2761927572241072 | 0.476 |
| 0.23282789841706603 | 0.394 |
| 0.2951753903523751 | 0.275 |
| 0.43096060052443486 | 0.244 |
| 0.47644314416568284 | 0.315 |
| 0.33734100240953413 | 0.451 |
| 0.24312970220599897 | 0.456 |
| 0.24862910253583043 | 0.333 |
| 0.35394051575207935 | 0.248 |
| 0.478858348950278 | 0.263 |
| 0.41950723944257456 | 0.379 |
| 0.2880991943581853 | 0.476 |
| 0.23072337094606782 | 0.412 |
| 0.2804928376268136 | 0.285 |
| 0.4144012052439173 | 0.24 |
| 0.4872156990750771 | 0.298 |
| 0.3555947130474982 | 0.436 |
| 0.25226926780627046 | 0.465 |
| 0.24263049784418067 | 0.352 |
| 0.3345697592355845 | 0.256 |
| 0.46565770884926383 | 0.257 |
| 0.43906026949104116 | 0.359 |
| 0.3013734718025085 | 0.473 |
| 0.231252860603273 | 0.428 |
| 0.26823350740774476 | 0.297 |
| 0.3968251474565885 | 0.239 |
| 0.4917338788151023 | 0.284 |
| 0.37464513856503123 | 0.419 |
| 0.2625658860231183 | 0.471 |
| 0.23768903564961805 | 0.371 |
| 0.31611428629708954 | 0.265 |
| 0.45058491414674273 | 0.251 |
| 0.4571942660262683 | 0.339 |
| 0.3163917688265342 | 0.465 |
| 0.234804793852487 | 0.442 |
| 0.25827125645202065 | 0.311 |
| 0.37812001088104497 | 0.241 |
| 0.4895770880211821 | 0.273 |
| 0.39444610515779077 | 0.402 |
| 0.27348118251669756 | 0.475 |
| 0.23362187422929234 | 0.39 |
| 0.29901757839208304 | 0.273 |
| 0.4348186508754168 | 0.245 |
| 0.47312211470834015 | 0.32 |
| 0.3331191107480632 | 0.454 |
| 0.2412185592578724 | 0.454 |
| 0.2502822825812398 | 0.328 |
| 0.3586442479907132 | 0.246 |
| 0.48151701271243413 | 0.265 |
| 0.4146843634045082 | 0.383 |
| 0.28514144147415504 | 0.477 |
| 0.23101781874394256 | 0.408 |
| 0.2837979317445062 | 0.283 |
| 0.4184501879254998 | 0.241 |
| 0.48515195752876267 | 0.302 |
| 0.3511398925362964 | 0.44 |
| 0.24993884010553524 | 0.463 |
| 0.2439527164610601 | 0.347 |
| 0.3391505965201735 | 0.254 |
| 0.46906356122453224 | 0.259 |
| 0.43448156293200835 | 0.364 |
| 0.29804106568914507 | 0.474 |
| 0.23085329951498082 | 0.424 |
| 0.27095027233923336 | 0.294 |
| 0.40114386810050284 | 0.239 |
| 0.4912700586510387 | 0.287 |
| 0.3700107699059198 | 0.423 |
| 0.2600335984734486 | 0.47 |
| 0.2387987347557494 | 0.367 |
| 0.3204287437029577 | 0.263 |
| 0.4542829591953911 | 0.252 |
| 0.45300839767622714 | 0.344 |
| 0.31262794866124777 | 0.468 |
| 0.23368081610298502 | 0.438 |
| 0.26046815909232224 | 0.307 |
| 0.38269466472666486 | 0.24 |
| 0.49067283032442766 | 0.276 |
| 0.3896375993421082 | 0.406 |
| 0.2708107247950097 | 0.475 |
| 0.23449778965885984 | 0.386 |
| 0.30296731432758034 | 0.271 |
| 0.43864383242530003 | 0.246 |
| 0.4695794672930395 | 0.324 |
| 0.328971842006405 | 0.457 |
| 0.23944229766931113 | 0.451 |
| 0.2520320576385097 | 0.324 |
| 0.3633466539477272 | 0.245 |
| 0.483919594113079 | 0.267 |
| 0.40983554964072666 | 0.388 |
| 0.2822550916298412 | 0.477 |
| 0.23145486823738395 | 0.404 |
| 0.28724222055622023 | 0.28 |
| 0.4224446311081783 | 0.241 |
| 0.4827418638850927 | 0.306 |
| 0.34673155176499737 | 0.443 |
| 0.24768608230051395 | 0.461 |
| 0.2453419769495757 | 0.343 |
| 0.34377779113979506 | 0.252 |
| 0.4723390351958057 | 0.26 |
| 0.42982816637650356 | 0.368 |
| 0.2948075550114963 | 0.475 |
| 0.23062873376105614 | 0.42 |
| 0.27380443669922394 | 0.291 |
| 0.40539462771196394 | 0.239 |
| 0.4904137312275005 | 0.29 |
| 0.36542017267709603 | 0.427 |
| 0.2575369104343095 | 0.468 |
| 0.23995354723610485 | 0.362 |
| 0.3248154585432751 | 0.261 |
| 0.4579378988483842 | 0.254 |
| 0.44871457200674 | 0.349 |
| 0.30896700388009024 | 0.469 |
| 0.23272667327708446 | 0.435 |
| 0.26278195187639597 | 0.304 |
| 0.3872156540390228 | 0.24 |
| 0.4914123826811147 | 0.278 |
| 0.38486542881557023 | 0.41 |
| 0.2681765590883509 | 0.474 |
| 0.23544299937406768 | 0.381 |
| 0.3070158581226565 | 0.269 |
| 0.44243926486176083 | 0.248 |
| 0.4658450364309185 | 0.329 |
| 0.32490688873408785 | 0.46 |
| 0.23781110445419393 | 0.448 |
| 0.2538831051370845 | 0.32 |
| 0.36803543104802916 | 0.244 |
| 0.486040763016896 | 0.269 |
| 0.4049755303313086 | 0.392 |
| 0.27943204796698845 | 0.476 |
| 0.2320207031692079 | 0.399 |
| 0.29082031266709335 | 0.278 |
| 0.42639012485578404 | 0.243 |
| 0.48001149480214295 | 0.31 |
| 0.3423745453845867 | 0.447 |
| 0.2455255147572912 | 0.459 |
| 0.24680636988421834 | 0.338 |
| 0.348441613373023 | 0.25 |
| 0.47545377351642365 | 0.262 |
| 0.42510888872272756 | 0.373 |
| 0.2916681099125944 | 0.476 |
| 0.23057568013700222 | 0.416 |
| 0.2767996311697479 | 0.288 |
| 0.40957838853781153 | 0.239 |
| 0.4891661750373026 | 0.294 |
| 0.36087227944657885 | 0.431 |
| 0.25508195010128687 | 0.467 |
| 0.24115543237404222 | 0.357 |
| 0.32926960222505397 | 0.258 |
| 0.4615363331689316 | 0.255 |
| 0.44432284072777944 | 0.354 |
| 0.30541032146920827 | 0.471 |
| 0.23194549381102472 | 0.432 |
| 0.2652172076495853 | 0.3 |
| 0.3916770007421434 | 0.239 |
| 0.4917831353814035 | 0.281 |
| 0.3801347127154838 | 0.414 |
| 0.2655753340220105 | 0.473 |
| 0.2364471043581732 | 0.377 |
| 0.31115525851650366 | 0.267 |
| 0.4462063519820284 | 0.249 |
| 0.46194551818885776 | 0.334 |
| 0.32093115609492723 | 0.462 |
| 0.23633325473095135 | 0.445 |
| 0.25583933585325397 | 0.316 |
| 0.37269902369489677 | 0.242 |
| 0.48785839148139065 | 0.271 |
| 0.400118590089331 | 0.397 |
| 0.2766644935645678 | 0.476 |
| 0.23270040904023329 | 0.395 |
| 0.2945249682016998 | 0.276 |
| 0.43029230191291845 | 0.244 |
| 0.47699061902840695 | 0.315 |
| 0.33807531346422 | 0.45 |
| 0.2434717245508992 | 0.457 |
| 0.24835364234820637 | 0.333 |
| 0.3531309285405753 | 0.248 |
| 0.4783764751621472 | 0.263 |
| 0.42033446246383066 | 0.378 |
| 0.2886165632310609 | 0.476 |
| 0.2306879498281861 | 0.412 |
| 0.2799377474506232 | 0.285 |
| 0.4136977421221173 | 0.24 |
| 0.48753465253404177 | 0.297 |
| 0.35636664863461104 | 0.435 |
| 0.25267759074999113 | 0.465 |
| 0.24240889168203109 | 0.353 |
| 0.33378585893576496 | 0.256 |
| 0.46505985955828855 | 0.257 |
| 0.4398410079610163 | 0.358 |
| 0.3019578426395571 | 0.473 |
| 0.23133948347479838 | 0.428 |
| 0.26777899317731535 | 0.297 |
| 0.3960742729631224 | 0.239 |
| 0.49177436067827784 | 0.284 |
| 0.3754480540840309 | 0.419 |
| 0.2630054625360238 | 0.471 |
| 0.23750243425491466 | 0.372 |
| 0.3153786313175191 | 0.265 |
| 0.44994415300967056 | 0.251 |
| 0.4579035960067875 | 0.338 |
| 0.3170504155651383 | 0.465 |
| 0.23501530962735373 | 0.442 |
| 0.2579042709968296 | 0.312 |
| 0.37732698040896273 | 0.241 |
| 0.489353359645353 | 0.273 |
| 0.3952776658117414 | 0.401 |
| 0.27394525471666237 | 0.475 |
| 0.23347886280097638 | 0.391 |
| 0.2983477155291242 | 0.274 |
| 0.4341564258924544 | 0.245 |
| 0.4737109403051543 | 0.319 |
| 0.3338413719111662 | 0.453 |
| 0.24153851267912227 | 0.454 |
| 0.2499907253466933 | 0.329 |
| 0.35783361993346463 | 0.247 |
| 0.4810764759352239 | 0.265 |
| 0.4155175202436941 | 0.382 |
| 0.285645694955801 | 0.477 |
| 0.23095656255806032 | 0.408 |
| 0.283218478129079 | 0.283 |
| 0.4177566567628045 | 0.24 |
| 0.4855328555774614 | 0.301 |
| 0.3519041759807345 | 0.439 |
| 0.2503351898858828 | 0.463 |
| 0.24372036526764543 | 0.348 |
| 0.33835784379173994 | 0.254 |
| 0.46848527110924626 | 0.258 |
| 0.4352759409940376 | 0.363 |
| 0.2986080187130953 | 0.474 |
| 0.23090960084987397 | 0.425 |
| 0.2704725450986985 | 0.294 |
| 0.4004046724432653 | 0.239 |
| 0.49137790615551163 | 0.287 |
| 0.3708060406903194 | 0.423 |
| 0.2604674589163321 | 0.47 |
| 0.2386043474653295 | 0.367 |
| 0.3196801508129392 | 0.263 |
| 0.4536486231018962 | 0.252 |
| 0.45373757473706255 | 0.343 |
| 0.3132691159076791 | 0.467 |
| 0.23386244857597416 | 0.439 |
| 0.26008145428805896 | 0.308 |
| 0.3819101668141232 | 0.24 |
| 0.4905090727892566 | 0.275 |
| 0.3904636158555392 | 0.405 |
| 0.2712680944090952 | 0.475 |
| 0.23434161672432377 | 0.386 |
| 0.3022795612218911 | 0.272 |
| 0.437987008039929 | 0.246 |
| 0.47020427692188965 | 0.324 |
| 0.32968068333720385 | 0.456 |
| 0.239738232800509 | 0.451 |
| 0.2517234991386938 | 0.325 |
| 0.3625371455579419 | 0.245 |
| 0.48352507007901374 | 0.267 |
| 0.4106721266794586 | 0.387 |
| 0.2827476225267585 | 0.477 |
| 0.23136998585692825 | 0.404 |
| 0.28663911128584446 | 0.281 |
| 0.42176010539117 | 0.241 |
| 0.483180700540699 | 0.305 |
| 0.34748753131869226 | 0.443 |
| 0.2480680313473295 | 0.461 |
| 0.24509749831470415 | 0.343 |
| 0.34297770199398514 | 0.252 |
| 0.4717853204914241 | 0.26 |
| 0.4306348333245242 | 0.368 |
| 0.2953577740978616 | 0.475 |
| 0.23065506355893026 | 0.421 |
| 0.2733027393982151 | 0.291 |
| 0.40466711982155296 | 0.239 |
| 0.4905892643815565 | 0.29 |
| 0.3662079832392057 | 0.427 |
| 0.25796427828858287 | 0.469 |
| 0.23975132616103037 | 0.363 |
| 0.3240547573579177 | 0.261 |
| 0.4573118073608135 | 0.254 |
| 0.4494615502638754 | 0.348 |
| 0.30959030876490123 | 0.469 |
| 0.23287879994881866 | 0.436 |
| 0.262374799155595 | 0.304 |
| 0.3864408698466982 | 0.24 |
| 0.49131093630648365 | 0.278 |
| 0.38568474544173403 | 0.409 |
| 0.2686279596241996 | 0.474 |
| 0.23527569934640843 | 0.382 |
| 0.3063116760554341 | 0.269 |
| 0.44178741066099414 | 0.248 |
| 0.4665008824117673 | 0.328 |
| 0.3256010288885009 | 0.459 |
| 0.23808140489963675 | 0.449 |
| 0.2535568032387022 | 0.32 |
| 0.3672291207928125 | 0.244 |
| 0.48569638826710865 | 0.269 |
| 0.405812994852367 | 0.391 |
| 0.27991424246567004 | 0.476 |
| 0.2319146771488567 | 0.4 |
| 0.2901946230753186 | 0.278 |
| 0.4257136264009384 | 0.242 |
| 0.48050346843441977 | 0.309 |
| 0.3431212604247704 | 0.446 |
| 0.24589053120635534 | 0.459 |
| 0.24654837803165786 | 0.339 |
| 0.3476359730152229 | 0.251 |
| 0.474929977182352 | 0.261 |
| 0.42592619665019976 | 0.372 |
| 0.29220252848254874 | 0.476 |
| 0.23057282437000598 | 0.417 |
| 0.2762734464122852 | 0.288 |
| 0.4088622815719454 | 0.239 |
| 0.4894087681495769 | 0.293 |
| 0.36165279204765566 | 0.431 |
| 0.25550157116183636 | 0.467 |
| 0.24094484463510307 | 0.358 |
| 0.32849764157983663 | 0.259 |
| 0.4609211487504806 | 0.255 |
| 0.44508608364089813 | 0.353 |
| 0.30601562715450675 | 0.471 |
| 0.23206763598461838 | 0.432 |
| 0.26478877862394073 | 0.301 |
| 0.3909128520274044 | 0.239 |
| 0.4917460504533749 | 0.28 |
| 0.38094663659130795 | 0.414 |
| 0.2660212258502947 | 0.473 |
| 0.23627028548958937 | 0.377 |
| 0.31043594551891823 | 0.267 |
| 0.4455593738869668 | 0.249 |
| 0.4626280691697395 | 0.333 |
| 0.321609478752736 | 0.462 |
| 0.2365766249576161 | 0.446 |
| 0.25549465607044314 | 0.316 |
| 0.37189783171294205 | 0.243 |
| 0.4875677535174886 | 0.271 |
| 0.40095455366291455 | 0.396 |
| 0.27713766171551435 | 0.476 |
| 0.23257584899241965 | 0.396 |
| 0.2938780524277446 | 0.276 |
| 0.4296228756346664 | 0.243 |
| 0.4775304120238941 | 0.314 |
| 0.3388115613592684 | 0.45 |
| 0.24381732939648346 | 0.457 |
| 0.24808085046665704 | 0.334 |
| 0.35232173938269584 | 0.249 |
| 0.47788798644864244 | 0.263 |
| 0.4211604200120975 | 0.377 |
| 0.28913632836054576 | 0.476 |
| 0.2306571754185516 | 0.413 |
| 0.2793868961412119 | 0.286 |
| 0.4129924826538015 | 0.24 |
| 0.48784260056697376 | 0.297 |
| 0.3571398608491914 | 0.434 |
| 0.25308774800810213 | 0.465 |
| 0.24218900456402181 | 0.353 |
| 0.33300361634204273 | 0.257 |
| 0.4644591079397298 | 0.257 |
| 0.4406192750492668 | 0.357 |
| 0.3025452641036547 | 0.472 |
| 0.2314313382349787 | 0.429 |
| 0.26732839078825293 | 0.298 |
| 0.39532140944766736 | 0.239 |
| 0.4918033269482388 | 0.283 |
| 0.3762522978479329 | 0.418 |
| 0.26344597904844946 | 0.472 |
| 0.23731720794928635 | 0.373 |
| 0.3146452939306654 | 0.265 |
| 0.44930241198133036 | 0.25 |
| 0.45860925281576065 | 0.338 |
| 0.31771201721966014 | 0.465 |
| 0.23523072780897875 | 0.443 |
| 0.2575406162876892 | 0.312 |
| 0.3765326176636806 | 0.241 |
| 0.4891195569707446 | 0.273 |
| 0.39611003035973535 | 0.4 |
| 0.2744105730251319 | 0.475 |
| 0.23333834993557762 | 0.391 |
| 0.2976810904225864 | 0.274 |
| 0.43349320807296904 | 0.245 |
| 0.47429303252851734 | 0.318 |
| 0.33456580779593387 | 0.453 |
| 0.24186241620917007 | 0.454 |
| 0.24970201091705718 | 0.33 |
| 0.3570230162358737 | 0.247 |
| 0.48062847007214515 | 0.265 |
| 0.4163498310030362 | 0.382 |
| 0.28615210964770776 | 0.477 |
| 0.23089960945237953 | 0.409 |
| 0.2826431826591511 | 0.283 |
| 0.4170614779311576 | 0.24 |
| 0.485903341451416 | 0.301 |
| 0.35266981505603395 | 0.438 |
| 0.2507337702102966 | 0.464 |
| 0.24348996190574382 | 0.349 |
| 0.33756651595988174 | 0.255 |
| 0.4679032668458005 | 0.258 |
| 0.4360680587534813 | 0.362 |
| 0.2991779310402782 | 0.474 |
| 0.23097111216163554 | 0.425 |
| 0.26999887601486466 | 0.295 |
| 0.39966345564302946 | 0.239 |
| 0.49147410130743496 | 0.286 |
| 0.3716026171134847 | 0.422 |
| 0.26090234642465693 | 0.47 |
| 0.23841129052568288 | 0.368 |
| 0.31893372661258984 | 0.263 |
| 0.45301307273186514 | 0.252 |
| 0.454463495361168 | 0.342 |
| 0.3139133286806646 | 0.467 |
| 0.2340491054922765 | 0.44 |
| 0.25969819590794463 | 0.309 |
| 0.3811241075819367 | 0.24 |
| 0.49033480856718586 | 0.275 |
| 0.391290683186724 | 0.404 |
| 0.27172655957831066 | 0.475 |
| 0.23418755572520417 | 0.387 |
| 0.30159478245780835 | 0.272 |
| 0.4373292917326621 | 0.246 |
| 0.4708232544856179 | 0.323 |
| 0.33039193163411706 | 0.456 |
| 0.24003843049134493 | 0.452 |
| 0.2514179265381111 | 0.325 |
| 0.36172729268248405 | 0.245 |
| 0.4831223082801528 | 0.266 |
| 0.4115082966355348 | 0.386 |
| 0.2832420730606555 | 0.477 |
| 0.23128900272137315 | 0.405 |
| 0.28604001012441493 | 0.281 |
| 0.42107409748096986 | 0.241 |
| 0.4836098788081861 | 0.305 |
| 0.3482450019894553 | 0.442 |
| 0.24845264105737302 | 0.462 |
| 0.24485520922166804 | 0.344 |
| 0.34217875657082447 | 0.253 |
| 0.47122699646239014 | 0.259 |
| 0.4314394912463355 | 0.367 |
| 0.29591081622920473 | 0.475 |
| 0.23068651388020378 | 0.421 |
| 0.27280521669680297 | 0.292 |
| 0.4039376107703986 | 0.239 |
| 0.49075315254406643 | 0.289 |
| 0.36699706492854917 | 0.426 |
| 0.25839284073988267 | 0.469 |
| 0.23955048007861604 | 0.364 |
| 0.32329608366666185 | 0.261 |
| 0.45668412985655676 | 0.253 |
| 0.45020558291572976 | 0.347 |
| 0.31021670769088927 | 0.469 |
| 0.23303604826401297 | 0.436 |
| 0.26197122569930265 | 0.305 |
| 0.3856643390659903 | 0.24 |
| 0.4911986001077763 | 0.277 |
| 0.38650527820360103 | 0.409 |
| 0.2690803474623995 | 0.474 |
| 0.2351101887135106 | 0.383 |
| 0.30561022668332144 | 0.27 |
| 0.441134717633082 | 0.247 |
| 0.4671517093166533 | 0.327 |
| 0.3262977867638332 | 0.459 |
| 0.2383562226227762 | 0.449 |
| 0.2532336056157552 | 0.321 |
| 0.3664221174428989 | 0.244 |
| 0.48534310301636596 | 0.268 |
| 0.40665048280643173 | 0.391 |
| 0.28039812141840476 | 0.476 |
| 0.23181210931249485 | 0.401 |
| 0.2895727335301127 | 0.279 |
| 0.42503581463125745 | 0.242 |
| 0.4809866561531736 | 0.309 |
| 0.34386965173058287 | 0.446 |
| 0.24625864499424624 | 0.46 |
| 0.2462928098449015 | 0.34 |
| 0.34683115136931214 | 0.251 |
| 0.4744006399109088 | 0.261 |
| 0.4267418037792087 | 0.371 |
| 0.2927395927523748 | 0.476 |
| 0.23057492006294197 | 0.418 |
| 0.2757515036672254 | 0.289 |
| 0.40814424300733565 | 0.239 |
| 0.48963989842617345 | 0.293 |
| 0.3624345559446445 | 0.43 |
| 0.255922636946599 | 0.467 |
| 0.2407357550284814 | 0.359 |
| 0.3277275559534568 | 0.259 |
| 0.4603038575022721 | 0.255 |
| 0.44584661819071614 | 0.352 |
| 0.30662403271723954 | 0.471 |
| 0.23219497119536597 | 0.433 |
| 0.26436407790194716 | 0.302 |
| 0.39014681689718744 | 0.239 |
| 0.49169774508661745 | 0.28 |
| 0.38175986479740337 | 0.413 |
| 0.2664680473644703 | 0.473 |
| 0.2360950127950577 | 0.378 |
| 0.30971915509641007 | 0.268 |
| 0.44491154434686925 | 0.249 |
| 0.4633062971920628 | 0.332 |
| 0.32229059725452935 | 0.462 |
| 0.23682471452173612 | 0.446 |
| 0.2551531851650974 | 0.317 |
| 0.371095629655832 | 0.243 |
| 0.4872676241905085 | 0.27 |
| 0.40179093514444086 | 0.395 |
| 0.2776122967062513 | 0.476 |
| 0.23245429524661296 | 0.397 |
| 0.2932346883566466 | 0.277 |
| 0.4289522958995243 | 0.243 |
| 0.47806235855524604 | 0.313 |
| 0.33954970590300565 | 0.449 |
| 0.24416644854739986 | 0.457 |
| 0.24781069351966262 | 0.335 |
| 0.351513011874177 | 0.249 |
| 0.4773930369061034 | 0.263 |
| 0.4219850436601331 | 0.376 |
| 0.28965852859958 | 0.476 |
| 0.23063109951855623 | 0.414 |
| 0.2788402902634255 | 0.286 |
| 0.4122854039045516 | 0.239 |
| 0.48813945935490055 | 0.296 |
| 0.35791434172261083 | 0.434 |
| 0.2534996765773176 | 0.466 |
| 0.24197080005006194 | 0.354 |
| 0.33222306684698016 | 0.257 |
| 0.463855582472173 | 0.256 |
| 0.4413950364258056 | 0.357 |
| 0.3031357473154763 | 0.472 |
| 0.23152842299179577 | 0.429 |
| 0.26688167347255465 | 0.298 |
| 0.39456656767365694 | 0.239 |
| 0.49182081308060016 | 0.283 |
| 0.3770578705788973 | 0.417 |
| 0.26388742816905586 | 0.472 |
| 0.23713337385592126 | 0.374 |
| 0.3139143017955051 | 0.266 |
| 0.448659719028717 | 0.25 |
| 0.45931115226198077 | 0.337 |
| 0.31837655395273323 | 0.464 |
| 0.2354510245074072 | 0.443 |
| 0.25718027378968805 | 0.313 |
| 0.3757369664305253 | 0.242 |
| 0.48887576002051053 | 0.272 |
| 0.3969431482489503 | 0.399 |
| 0.27487716712152677 | 0.476 |
| 0.23320040732064254 | 0.392 |
| 0.2970177495204926 | 0.274 |
| 0.4328289762650203 | 0.244 |
| 0.47486823002683665 | 0.317 |
| 0.33529237732030887 | 0.452 |
| 0.24219021024276 | 0.455 |
| 0.24941611156806337 | 0.331 |
| 0.35621250140835337 | 0.247 |
| 0.48017313671975975 | 0.264 |
| 0.4171812212859414 | 0.381 |
| 0.286660726884765 | 0.476 |
| 0.23084702347687924 | 0.41 |
| 0.28207206437703836 | 0.284 |
| 0.4163646242390689 | 0.24 |
| 0.48626330054469546 | 0.3 |
| 0.35343679207528855 | 0.438 |
| 0.2511345096655062 | 0.464 |
| 0.24326146541196347 | 0.35 |
| 0.33677665658030675 | 0.255 |
| 0.46731769544949164 | 0.258 |
| 0.4368578776639251 | 0.361 |
| 0.2997508216579824 | 0.474 |
| 0.2310378416202024 | 0.426 |
| 0.2695292414494456 | 0.295 |
| 0.3989202195089723 | 0.239 |
| 0.4915586583842673 | 0.286 |
| 0.3724005046797755 | 0.421 |
| 0.26133824042425857 | 0.471 |
| 0.23821956507358677 | 0.369 |
| 0.3181894957064187 | 0.264 |
| 0.4523763577579264 | 0.252 |
| 0.4551860960445693 | 0.342 |
| 0.3145605743630336 | 0.466 |
| 0.23424076768773988 | 0.44 |
| 0.2593183628829542 | 0.309 |
| 0.38033652340555407 | 0.241 |
| 0.4901501085104515 | 0.275 |
| 0.3921187645934703 | 0.404 |
| 0.2721861434331255 | 0.475 |
| 0.23403566920044414 | 0.388 |
| 0.30091302225287175 | 0.272 |
| 0.43667066909607855 | 0.246 |
| 0.4714362499993935 | 0.322 |
| 0.33110554803047776 | 0.455 |
| 0.2403428410658247 | 0.452 |
| 0.2511153172003743 | 0.326 |
| 0.3609171578089763 | 0.246 |
| 0.48271143439599823 | 0.266 |
| 0.412343983680472 | 0.385 |
| 0.2837384847381844 | 0.477 |
| 0.2312119917615811 | 0.406 |
| 0.2854449474693953 | 0.281 |
| 0.4203865782614254 | 0.241 |
| 0.48402925903100713 | 0.304 |
| 0.34900393659107853 | 0.441 |
| 0.2488398360876127 | 0.462 |
| 0.2446150680507007 | 0.345 |
| 0.34138100666781696 | 0.253 |
| 0.4706642212994245 | 0.259 |
| 0.43224209306830924 | 0.366 |
| 0.29646670796748975 | 0.475 |
| 0.23072310555800893 | 0.422 |
| 0.27231185152886805 | 0.292 |
| 0.4032060934570683 | 0.239 |
| 0.49090538270011586 | 0.289 |
| 0.3677874233565876 | 0.425 |
| 0.258822563001126 | 0.469 |
| 0.23935099531068865 | 0.364 |
| 0.32253946205651235 | 0.262 |
| 0.4560549408443288 | 0.253 |
| 0.4509466226787665 | 0.346 |
| 0.3108461953177573 | 0.469 |
| 0.23319840318918852 | 0.437 |
| 0.26157120734402534 | 0.306 |
| 0.3848860904326624 | 0.24 |
| 0.49107543663163705 | 0.277 |
| 0.38732700436441736 | 0.408 |
| 0.2695337378960481 | 0.474 |
| 0.2349465177483331 | 0.383 |
| 0.3049115495597851 | 0.27 |
| 0.4404811807595137 | 0.247 |
| 0.46779738479871036 | 0.327 |
| 0.32699712813198867 | 0.458 |
| 0.23863551771584066 | 0.45 |
| 0.2529134931970659 | 0.322 |
| 0.36561447906193556 | 0.244 |
| 0.48498101634223983 | 0.268 |
| 0.4074879218637382 | 0.39 |
| 0.2808837243738383 | 0.476 |
| 0.23171307717396775 | 0.402 |
| 0.2889546833054146 | 0.279 |
| 0.42435666076513434 | 0.242 |
| 0.4814609013540562 | 0.308 |
| 0.3446196844157148 | 0.445 |
| 0.24662978160865964 | 0.46 |
| 0.24603962627531942 | 0.34 |
| 0.34602720711811674 | 0.251 |
| 0.47386592266515176 | 0.261 |
| 0.42755565268146367 | 0.371 |
| 0.29327933591449445 | 0.475 |
| 0.23058200232382486 | 0.418 |
| 0.2752337955453684 | 0.289 |
| 0.40742425756625544 | 0.239 |
| 0.48985952107216374 | 0.292 |
| 0.3632175724478042 | 0.429 |
| 0.25634509862339266 | 0.468 |
| 0.24052813741866713 | 0.36 |
| 0.3269593732499041 | 0.26 |
| 0.4596845598692254 | 0.255 |
| 0.4466044070950703 | 0.351 |
| 0.3072355402433021 | 0.47 |
| 0.23232748926789915 | 0.434 |
| 0.263943078926102 | 0.302 |
| 0.38937891610084185 | 0.239 |
| 0.4916382718829013 | 0.279 |
| 0.38257438715653924 | 0.412 |
| 0.2669158044668196 | 0.473 |
| 0.23592132201822824 | 0.379 |
| 0.30900492103210436 | 0.268 |
| 0.44426287113692964 | 0.249 |
| 0.46398009145386176 | 0.331 |
| 0.3229744835679404 | 0.461 |
| 0.23707749197429975 | 0.447 |
| 0.25481490555351677 | 0.318 |
| 0.37029246952405726 | 0.243 |
| 0.48695809754893904 | 0.27 |
| 0.40262767022286705 | 0.394 |
| 0.27808843435858915 | 0.476 |
| 0.23233582525127938 | 0.397 |
| 0.29259492074632704 | 0.277 |
| 0.42828053631199403 | 0.243 |
| 0.47858629438190586 | 0.312 |
| 0.34028970739773684 | 0.448 |
| 0.2445190125784074 | 0.458 |
| 0.24754313719369708 | 0.336 |
| 0.35070480914124735 | 0.249 |
| 0.47689178224228973 | 0.262 |
| 0.4228082663866304 | 0.375 |
| 0.29018320214429266 | 0.476 |
| 0.23060977157853713 | 0.414 |
| 0.2782979342331092 | 0.287 |
| 0.41157648389846957 | 0.239 |
| 0.4884251507343082 | 0.296 |
| 0.3586900848519392 | 0.433 |
| 0.2539133152908251 | 0.466 |
| 0.24175424288480304 | 0.355 |
| 0.3314442445557945 | 0.257 |
| 0.463249407847757 | 0.256 |
| 0.44216825790327763 | 0.356 |
| 0.3037293020468324 | 0.472 |
| 0.23163073440899648 | 0.43 |
| 0.26643881425491 | 0.299 |
| 0.3938097599147048 | 0.239 |
| 0.49182685753767225 | 0.282 |
| 0.3778647717269439 | 0.416 |
| 0.26432980461713346 | 0.472 |
| 0.23695095188151682 | 0.374 |
| 0.3131856833417104 | 0.266 |
| 0.4480160987835162 | 0.25 |
| 0.4600092063120586 | 0.336 |
| 0.3190440046935987 | 0.464 |
| 0.23567617487917183 | 0.444 |
| 0.25682322526959384 | 0.314 |
| 0.37494007174446664 | 0.242 |
| 0.4886220506255646 | 0.272 |
| 0.3977769666876138 | 0.399 |
| 0.2753450676937409 | 0.476 |
| 0.233065107848383 | 0.393 |
| 0.29635773933450393 | 0.275 |
| 0.4321637083772031 | 0.244 |
| 0.47543637026851665 | 0.317 |
| 0.3360210393204607 | 0.452 |
| 0.24252183355506873 | 0.455 |
| 0.24913299861062527 | 0.331 |
| 0.3554021400224442 | 0.248 |
| 0.4797106199491239 | 0.264 |
| 0.41801161742512116 | 0.38 |
| 0.28717158773979 | 0.476 |
| 0.23079886677695058 | 0.41 |
| 0.2815051402129408 | 0.284 |
| 0.41566606906389997 | 0.24 |
| 0.48661262322793 | 0.299 |
| 0.35420509105928877 | 0.437 |
| 0.25153733798750094 | 0.464 |
| 0.24303483531669223 | 0.35 |
| 0.3359883077541145 | 0.255 |
| 0.466728701217415 | 0.257 |
| 0.43764536027490625 | 0.361 |
| 0.3003267082034196 | 0.473 |
| 0.2311097954603795 | 0.426 |
| 0.26906361698070913 | 0.296 |
| 0.398174967406047 | 0.239 |
| 0.491631595769339 | 0.285 |
| 0.3731997083989006 | 0.42 |
| 0.26177512271121767 | 0.471 |
| 0.23802917495063383 | 0.37 |
| 0.3174474830279595 | 0.264 |
| 0.45173852384876007 | 0.251 |
| 0.4559053099759501 | 0.341 |
| 0.31521083908978353 | 0.466 |
| 0.23443741525996872 | 0.441 |
| 0.2589419346528097 | 0.31 |
| 0.3795474519528041 | 0.241 |
| 0.48995504492881964 | 0.274 |
| 0.3929478208939809 | 0.403 |
| 0.2726468703186435 | 0.475 |
| 0.2338860215097849 | 0.389 |
| 0.30023432541416223 | 0.273 |
| 0.43601112439132045 | 0.246 |
| 0.4720431110137597 | 0.321 |
| 0.3318214930823388 | 0.455 |
| 0.2406514131098168 | 0.453 |
| 0.25081564769880793 | 0.327 |
| 0.360106803963912 | 0.246 |
| 0.4822925769705973 | 0.266 |
| 0.41317911188077344 | 0.384 |
| 0.2842368991965021 | 0.477 |
| 0.23113902466632863 | 0.406 |
| 0.28485395190547125 | 0.282 |
| 0.41969751878206873 | 0.241 |
| 0.4844387053427112 | 0.303 |
| 0.34976430948468323 | 0.441 |
| 0.24922954143016957 | 0.462 |
| 0.24437703304076838 | 0.346 |
| 0.34058450272231894 | 0.253 |
| 0.47009715185587325 | 0.259 |
| 0.4330425933898563 | 0.365 |
| 0.2970254746172053 | 0.474 |
| 0.23076485709238348 | 0.423 |
| 0.27182262545640995 | 0.293 |
| 0.4024725622841597 | 0.239 |
| 0.4910459469213938 | 0.288 |
| 0.3685790644478215 | 0.425 |
| 0.25925341276131214 | 0.469 |
| 0.2391528605949526 | 0.365 |
| 0.32178491687848215 | 0.262 |
| 0.45542431040679326 | 0.253 |
| 0.45168461988143727 | 0.345 |
| 0.31147876504496963 | 0.468 |
| 0.23336584896589285 | 0.437 |
| 0.2611747204463705 | 0.306 |
| 0.38410615401845843 | 0.24 |
| 0.4909415098971934 | 0.277 |
| 0.3881498988328853 | 0.407 |
| 0.26998814767080825 | 0.474 |
| 0.23478473902341052 | 0.384 |
| 0.30421568516155856 | 0.271 |
| 0.4398267931835953 | 0.247 |
| 0.4684377731227579 | 0.326 |
| 0.32769901783016825 | 0.458 |
| 0.23891924865608072 | 0.45 |
| 0.2525964464358941 | 0.323 |
| 0.36480626461491505 | 0.244 |
| 0.48461024012294174 | 0.268 |
| 0.40832523874905313 | 0.389 |
| 0.28137109135517135 | 0.477 |
| 0.23161765778638063 | 0.402 |
| 0.2883405103691966 | 0.279 |
| 0.42367613581100216 | 0.242 |
| 0.48192604970680153 | 0.307 |
| 0.3453713247371427 | 0.444 |
| 0.2470038660672632 | 0.46 |
| 0.24578878764340154 | 0.341 |
| 0.345224197908227 | 0.252 |
| 0.47332598653120256 | 0.26 |
| 0.4283676877278106 | 0.37 |
| 0.29382179011724396 | 0.475 |
| 0.2305941037490697 | 0.419 |
| 0.27472031280434656 | 0.29 |
| 0.40670231129388845 | 0.239 |
| 0.490067596973614 | 0.291 |
| 0.3640018438879276 | 0.429 |
| 0.25676890970285193 | 0.468 |
| 0.24032196760148378 | 0.36 |
| 0.32619312057426725 | 0.26 |
| 0.4590633518646434 | 0.254 |
| 0.4473594118374959 | 0.35 |
| 0.3078501505223103 | 0.47 |
| 0.23246517907934408 | 0.434 |
| 0.2635257554440477 | 0.303 |
| 0.3886091717959845 | 0.239 |
| 0.491567685390996 | 0.279 |
| 0.3833901914986587 | 0.412 |
| 0.26736450480085744 | 0.473 |
| 0.23574925152723625 | 0.38 |
| 0.30829327811659063 | 0.268 |
| 0.44361335955248865 | 0.248 |
| 0.46464933727675567 | 0.33 |
| 0.32366110851915586 | 0.461 |
| 0.23733492453501412 | 0.447 |
| 0.2544797995531149 | 0.318 |
| 0.36948840444548847 | 0.243 |
| 0.4866392700484476 | 0.27 |
| 0.4034646929215291 | 0.393 |
| 0.2785661112455007 | 0.476 |
| 0.23222051679620975 | 0.398 |
| 0.29195879367427974 | 0.277 |
| 0.42760756992749405 | 0.243 |
| 0.47910205589947324 | 0.312 |
| 0.3410315267405612 | 0.448 |
| 0.24487495092766492 | 0.458 |
| 0.2472781462595574 | 0.337 |
| 0.3498971937502426 | 0.25 |
| 0.4763843795848972 | 0.262 |
| 0.4236300226655702 | 0.375 |
| 0.29071038647006847 | 0.476 |
| 0.2305932386483367 | 0.415 |
| 0.2777598303385248 | 0.287 |
| 0.41086570167985065 | 0.239 |
| 0.4886996022540682 | 0.295 |
| 0.3594670853440796 | 0.432 |
| 0.2543286049154011 | 0.466 |
| 0.24153929911492228 | 0.356 |
| 0.3306671823405215 | 0.258 |
| 0.4626407048330298 | 0.256 |
| 0.4429389052454697 | 0.355 |
| 0.30432593672677044 | 0.472 |
| 0.23173826778915882 | 0.431 |
| 0.2659997860422158 | 0.299 |
| 0.39305099994091364 | 0.239 |
| 0.491821501608537 | 0.282 |
| 0.378672999347876 | 0.416 |
| 0.2647731051696887 | 0.472 |
| 0.23676996470920983 | 0.375 |
| 0.3124594678257051 | 0.266 |
| 0.4473715726684771 | 0.25 |
| 0.4607033230439994 | 0.335 |
| 0.31971434714450114 | 0.463 |
| 0.2359061530761944 | 0.444 |
| 0.2564694527449177 | 0.314 |
| 0.3741419798790308 | 0.242 |
| 0.48835851250799034 | 0.272 |
| 0.39861143070753513 | 0.398 |
| 0.2758143064028973 | 0.476 |
| 0.2329325254971795 | 0.394 |
| 0.29570110633589897 | 0.275 |
| 0.4314973814385436 | 0.244 |
| 0.4759972897923271 | 0.316 |
| 0.33675175264650503 | 0.451 |
| 0.24285722334956383 | 0.456 |
| 0.24885264237951638 | 0.332 |
| 0.3545919966208954 | 0.248 |
| 0.4792410661896752 | 0.264 |
| 0.4188409466147963 | 0.379 |
| 0.28768473295409536 | 0.476 |
| 0.2307551994986491 | 0.411 |
| 0.28094242495901345 | 0.285 |
| 0.4149657864214445 | 0.24 |
| 0.48695120500548184 | 0.299 |
| 0.354974697734415 | 0.436 |
| 0.25194218619249403 | 0.465 |
| 0.24281003176193539 | 0.351 |
| 0.33520151013790855 | 0.256 |
| 0.4661364255164194 | 0.257 |
| 0.43843047009098624 | 0.36 |
| 0.3009056069584892 | 0.473 |
| 0.23118697806387342 | 0.427 |
| 0.26860197750696285 | 0.296 |
| 0.397427704252662 | 0.239 |
| 0.49169293576272793 | 0.285 |
| 0.37400023264630405 | 0.42 |
| 0.26221297741531713 | 0.471 |
| 0.23784012673170407 | 0.371 |
| 0.31670771392780855 | 0.264 |
| 0.451099612771983 | 0.251 |
| 0.45662106691396487 | 0.34 |
| 0.3158641077491842 | 0.466 |
| 0.2346390275436031 | 0.441 |
| 0.25856889114276627 | 0.311 |
| 0.37875693217776674 | 0.241 |
| 0.4897496916284877 | 0.274 |
| 0.3937778104812145 | 0.402 |
| 0.27310876575782556 | 0.475 |
| 0.2337386787369075 | 0.389 |
| 0.29955873725928994 | 0.273 |
| 0.4353506406224831 | 0.245 |
| 0.4726436828127918 | 0.32 |
| 0.3325397268450538 | 0.454 |
| 0.24096409347270958 | 0.453 |
| 0.25051889377446585 | 0.328 |
| 0.3592962946373019 | 0.246 |
| 0.48186586737964554 | 0.265 |
| 0.4140136053461275 | 0.384 |
| 0.2847373581380956 | 0.477 |
| 0.23107017175682448 | 0.407 |
| 0.28426705013612164 | 0.282 |
| 0.41900689032641253 | 0.241 |
| 0.48483808590047284 | 0.303 |
| 0.35052609662601875 | 0.44 |
| 0.24962168255584385 | 0.463 |
| 0.24414106239080222 | 0.347 |
| 0.3397892937773181 | 0.254 |
| 0.46952594339716297 | 0.259 |
| 0.43384094841531784 | 0.364 |
| 0.2975871402010985 | 0.474 |
| 0.23081178470614291 | 0.423 |
| 0.2713375187665176 | 0.293 |
| 0.40173701317601973 | 0.239 |
| 0.4911748422181291 | 0.288 |
| 0.36937199430412815 | 0.424 |
| 0.25968536018239813 | 0.47 |
| 0.2389560671495589 | 0.366 |
| 0.32103247234848775 | 0.262 |
| 0.45479230424769995 | 0.253 |
| 0.45241952228405846 | 0.345 |
| 0.31211440901533855 | 0.468 |
| 0.2335383691252594 | 0.438 |
| 0.260781741896952 | 0.307 |
| 0.38332456122183506 | 0.24 |
| 0.49079688536155863 | 0.276 |
| 0.38897393412816955 | 0.407 |
| 0.2704435949403693 | 0.474 |
| 0.23462490733888336 | 0.385 |
| 0.3035226748478066 | 0.271 |
| 0.4391715463075395 | 0.247 |
| 0.4690727352950503 | 0.325 |
| 0.32840341981146565 | 0.457 |
| 0.23920737227026723 | 0.451 |
| 0.2522824452489225 | 0.323 |
| 0.36399753391543765 | 0.245 |
| 0.4842308890765333 | 0.267 |
| 0.40916235938096457 | 0.388 |
| 0.28186026280557847 | 0.477 |
| 0.2315259276034487 | 0.403 |
| 0.28773025128491836 | 0.28 |
| 0.42299421062921977 | 0.242 |
| 0.4823819494309027 | 0.307 |
| 0.3461245401781222 | 0.444 |
| 0.24738082304981407 | 0.461 |
| 0.24554025370968124 | 0.342 |
| 0.34442218028077687 | 0.252 |
| 0.4727809924718548 | 0.26 |
| 0.42917785509890044 | 0.369 |
| 0.29436698641947195 | 0.475 |
| 0.2306112544346717 | 0.42 |
| 0.27421104441913136 | 0.29 |
| 0.4059783915989458 | 0.239 |
| 0.49026409263195075 | 0.291 |
| 0.3647873735071091 | 0.428 |
| 0.25719402608085795 | 0.468 |
| 0.24011722339978198 | 0.361 |
| 0.32542882432383397 | 0.26 |
| 0.4584403250359939 | 0.254 |
| 0.448111592460134 | 0.349 |
| 0.3084678630554119 | 0.47 |
| 0.23260802861353305 | 0.435 |
| 0.263112081561615 | 0.303 |
| 0.3878376075340234 | 0.239 |
| 0.49148604199253054 | 0.279 |
| 0.38420726358012924 | 0.411 |
| 0.2678141576983651 | 0.473 |
| 0.23557884227045667 | 0.38 |
| 0.3075842621524947 | 0.269 |
| 0.4429630125281422 | 0.248 |
| 0.4653139161567469 | 0.33 |
| 0.3243504418186246 | 0.46 |
| 0.23759697803678598 | 0.448 |
| 0.2541478493169137 | 0.319 |
| 0.3686834886457123 | 0.243 |
| 0.48631124063495385 | 0.269 |
| 0.404301935709273 | 0.393 |
| 0.27904536464809715 | 0.476 |
| 0.23210844787659785 | 0.399 |
| 0.29132635042579064 | 0.278 |
| 0.4269333693089482 | 0.243 |
| 0.47960948042175205 | 0.311 |
| 0.3417751255232589 | 0.447 |
| 0.2452341919970266 | 0.459 |
| 0.24701568460545237 | 0.337 |
| 0.349090227618836 | 0.25 |
| 0.475870987279209 | 0.262 |
| 0.424450248545665 | 0.374 |
| 0.291240118269607 | 0.476 |
| 0.23058154533662553 | 0.416 |
| 0.27722597876974026 | 0.288 |
| 0.4101530373724742 | 0.239 |
| 0.4889627472139357 | 0.294 |
| 0.3602453397510241 | 0.432 |
| 0.2547454882411167 | 0.467 |
| 0.24132593620455958 | 0.357 |
| 0.32989191190094996 | 0.258 |
| 0.4620295901446289 | 0.256 |
| 0.4437069439703126 | 0.354 |
| 0.3049256584486501 | 0.471 |
| 0.23185101715435028 | 0.431 |
| 0.26556456170887477 | 0.3 |
| 0.3922903030042989 | 0.239 |
| 0.4918047892355668 | 0.281 |
| 0.3794825499860609 | 0.415 |
| 0.2652173286073951 | 0.472 |
| 0.2365904377857094 | 0.376 |
| 0.3117356853798179 | 0.267 |
| 0.44672615902475044 | 0.249 |
| 0.4613934066148786 | 0.334 |
| 0.32038755778902467 | 0.463 |
| 0.23614093219210253 | 0.445 |
| 0.25611893842954087 | 0.315 |
| 0.37334273833333126 | 0.242 |
| 0.48808523136811993 | 0.271 |
| 0.39944648323446885 | 0.397 |
| 0.276284915847562 | 0.476 |
| 0.2328027352098522 | 0.394 |
| 0.2950478968488851 | 0.275 |
| 0.4308299716570253 | 0.244 |
| 0.47655082446466085 | 0.315 |
| 0.33748447626025313 | 0.451 |
| 0.2431963153140241 | 0.456 |
| 0.24857501222820208 | 0.333 |
| 0.3537821356265511 | 0.248 |
| 0.47876462409905984 | 0.263 |
| 0.41966913703738246 | 0.378 |
| 0.28820020286824605 | 0.476 |
| 0.2307160797008793 | 0.412 |
| 0.28038393125151356 | 0.285 |
| 0.4142637510348846 | 0.24 |
| 0.4872789466566103 | 0.298 |
| 0.35574559952125234 | 0.436 |
| 0.25234898670338796 | 0.465 |
| 0.24258701562032664 | 0.352 |
| 0.33441630296184177 | 0.256 |
| 0.4655410065815828 | 0.257 |
| 0.43921317142008937 | 0.359 |
| 0.3014875328471388 | 0.473 |
| 0.2312693920433716 | 0.428 |
| 0.26814429734904166 | 0.297 |
| 0.3966784365156897 | 0.239 |
| 0.4917427043901031 | 0.284 |
| 0.37480208102512125 | 0.419 |
| 0.26265179095942026 | 0.471 |
| 0.2376524297471572 | 0.371 |
| 0.3159702142573568 | 0.265 |
| 0.45045966250340364 | 0.251 |
| 0.4573332930766918 | 0.339 |
| 0.31652036398410077 | 0.465 |
| 0.234845583079835 | 0.442 |
| 0.258199212734787 | 0.311 |
| 0.3779650043144986 | 0.241 |
| 0.4895341239612179 | 0.273 |
| 0.3946086893457507 | 0.401 |
| 0.2735718564155161 | 0.475 |
| 0.23359370858857134 | 0.39 |
| 0.29888630353200873 | 0.273 |
| 0.43468919960777236 | 0.245 |
| 0.4732378086225664 | 0.32 |
| 0.3332602089538593 | 0.454 |
| 0.2412808272766425 | 0.454 |
| 0.2502250302987132 | 0.328 |
| 0.3584856937040477 | 0.247 |
| 0.4814314397835236 | 0.265 |
| 0.41484738837673163 | 0.383 |
| 0.2852399032642871 | 0.477 |
| 0.23100550186529054 | 0.408 |
| 0.2836842669218106 | 0.283 |
| 0.4183146644809898 | 0.241 |
| 0.4852272731077245 | 0.302 |
| 0.35128927560500595 | 0.439 |
| 0.2500161855572005 | 0.463 |
| 0.24390711436491427 | 0.347 |
| 0.33899542745441963 | 0.254 |
| 0.46895074935392517 | 0.258 |
| 0.4346371158724074 | 0.364 |
| 0.2981517274395247 | 0.474 |
| 0.23086390240684312 | 0.424 |
| 0.2708565105709616 | 0.294 |
| 0.40099944359261147 | 0.239 |
| 0.49129207038059214 | 0.287 |
| 0.37016621906678027 | 0.423 |
| 0.2601183778893359 | 0.47 |
| 0.23876060873163296 | 0.367 |
| 0.32028215264761084 | 0.263 |
| 0.4541589837507767 | 0.252 |
| 0.4531512749067037 | 0.344 |
| 0.31275311811786116 | 0.467 |
| 0.23371594649537947 | 0.439 |
| 0.2603922491275177 | 0.308 |
| 0.3825413447595885 | 0.24 |
| 0.49064162989916255 | 0.276 |
| 0.3897990803532951 | 0.406 |
| 0.27090009922349495 | 0.475 |
| 0.23446707964605268 | 0.386 |
| 0.3028325608120022 | 0.271 |
| 0.43851542988537523 | 0.246 |
| 0.4697021292057137 | 0.324 |
| 0.329110297200076 | 0.457 |
| 0.23949984370456212 | 0.451 |
| 0.2519714689575448 | 0.324 |
| 0.3631883475688312 | 0.245 |
| 0.48384308078929433 | 0.267 |
| 0.4099992090142633 | 0.387 |
| 0.28235127953157213 | 0.477 |
| 0.231437962341883 | 0.404 |
| 0.28712394111704714 | 0.28 |
| 0.42231085599517376 | 0.241 |
| 0.4828284515666417 | 0.306 |
| 0.3468792995262948 | 0.443 |
| 0.24776057703386453 | 0.461 |
| 0.2452939837516061 | 0.343 |
| 0.34362120960726306 | 0.252 |
| 0.4722311010764174 | 0.26 |
| 0.4299861027826036 | 0.368 |
| 0.2949149547486268 | 0.475 |
| 0.23063348199594205 | 0.42 |
| 0.2737059776583402 | 0.291 |
| 0.4052524872904514 | 0.239 |
| 0.49044898008194926 | 0.29 |
| 0.3655741653434814 | 0.427 |
| 0.2576204060726607 | 0.468 |
| 0.23991388475440914 | 0.362 |
| 0.3246665102824674 | 0.261 |
| 0.45781556644590105 | 0.254 |
| 0.4488609073587365 | 0.349 |
| 0.30908867606255336 | 0.469 |
| 0.2327560250089664 | 0.435 |
| 0.2627020317893617 | 0.304 |
| 0.38706424824640645 | 0.24 |
| 0.4913933998008581 | 0.278 |
| 0.385025587010382 | 0.41 |
| 0.26826477412758587 | 0.474 |
| 0.23541013772724811 | 0.381 |
| 0.3068779099510426 | 0.269 |
| 0.44231183075365677 | 0.248 |
| 0.4659737058291132 | 0.329 |
| 0.325042452090654 | 0.46 |
| 0.23786361687216756 | 0.448 |
| 0.2538190367677058 | 0.32 |
| 0.36787777741468897 | 0.244 |
| 0.48597411082276665 | 0.269 |
| 0.4051393296175128 | 0.392 |
| 0.27952623251078773 | 0.476 |
| 0.23199969655569017 | 0.399 |
| 0.29069763338313753 | 0.278 |
| 0.4262579065839232 | 0.242 |
| 0.4801084064641038 | 0.31 |
| 0.3425204661306789 | 0.447 |
| 0.24559666325896226 | 0.459 |
| 0.24675571527683113 | 0.338 |
| 0.34828397192940214 | 0.25 |
| 0.4753517646757478 | 0.262 |
| 0.4252688817192552 | 0.373 |
| 0.2917724333932564 | 0.476 |
| 0.2305747337791266 | 0.416 |
| 0.2766963776557984 | 0.288 |
| 0.40943847223623575 | 0.239 |
| 0.4892145246845843 | 0.294 |
| 0.3610248459965233 | 0.431 |
| 0.25516391016332085 | 0.467 |
| 0.24111412314840033 | 0.357 |
| 0.3291184638319117 | 0.259 |
| 0.4614161763401751 | 0.255 |
| 0.44447233914848294 | 0.353 |
| 0.30552847297794306 | 0.471 |
| 0.23196897532368085 | 0.432 |
| 0.26513311417740315 | 0.301 |
| 0.3915276858235939 | 0.239 |
| 0.49177676684866145 | 0.281 |
| 0.3802934185625715 | 0.414 |
| 0.2656624756598627 | 0.473 |
| 0.23641239930272814 | 0.377 |
| 0.3110143670541923 | 0.267 |
| 0.4460798732393817 | 0.249 |
| 0.4620793572428089 | 0.334 |
| 0.3210636119027192 | 0.462 |
| 0.23638048420661745 | 0.445 |
| 0.25577166467631884 | 0.316 |
| 0.3725423958168787 | 0.242 |
| 0.48780229497400196 | 0.271 |
| 0.4002820651661452 | 0.396 |
| 0.2767569295272071 | 0.476 |
| 0.23267581276888902 | 0.395 |
| 0.2943981569417325 | 0.276 |
| 0.43016145447704507 | 0.244 |
| 0.4770968097429864 | 0.314 |
| 0.33821916933457896 | 0.45 |
| 0.24353904368465923 | 0.457 |
| 0.2483000765299858 | 0.334 |
| 0.3529726212504477 | 0.248 |
| 0.47828144441921 | 0.263 |
| 0.4204961179839073 | 0.378 |
| 0.2887180373533418 | 0.476 |
| 0.23068156327491893 | 0.413 |
| 0.27982966956108957 | 0.285 |
| 0.41355993840278654 | 0.24 |
| 0.48759575436001057 | 0.297 |
| 0.35651778551389285 | 0.435 |
| 0.25275767347114697 | 0.465 |
| 0.24236574861477478 | 0.353 |
| 0.3336327240554875 | 0.256 |
| 0.4649425793261405 | 0.257 |
| 0.4399934292119063 | 0.358 |
| 0.3020724994350857 | 0.473 |
| 0.23135703832788873 | 0.428 |
| 0.2676905503511694 | 0.297 |
| 0.3959271722030677 | 0.239 |
| 0.4917809312110779 | 0.284 |
| 0.3756052562303651 | 0.418 |
| 0.2630915520153123 | 0.471 |
| 0.2374660960987866 | 0.372 |
| 0.31523501044764807 | 0.265 |
| 0.4498187073416387 | 0.251 |
| 0.45804191104373326 | 0.338 |
| 0.31717959019381653 | 0.465 |
| 0.23505705958062348 | 0.442 |
| 0.2578328802334229 | 0.312 |
| 0.377171709870318 | 0.241 |
| 0.48930841888271265 | 0.273 |
| 0.395440411107107 | 0.401 |
| 0.27403617006306114 | 0.475 |
| 0.2334511802898475 | 0.391 |
| 0.29821707031286854 | 0.274 |
| 0.4340267820477058 | 0.245 |
| 0.47382532982944475 | 0.319 |
| 0.333982898708223 | 0.453 |
| 0.24160155793353677 | 0.454 |
| 0.24993403124069496 | 0.329 |
| 0.35767506534230675 | 0.247 |
| 0.48098943106602765 | 0.265 |
| 0.41568038560899023 | 0.382 |
| 0.2857445762076446 | 0.477 |
| 0.23094508221813084 | 0.409 |
| 0.28310562502513087 | 0.283 |
| 0.4176208132049414 | 0.24 |
| 0.48560614382490486 | 0.301 |
| 0.35205382567716126 | 0.439 |
| 0.2504129772904792 | 0.463 |
| 0.2436751474011474 | 0.348 |
| 0.3382029499342769 | 0.254 |
| 0.4683717210800813 | 0.258 |
| 0.4354310549174736 | 0.363 |
| 0.2987192577333206 | 0.474 |
| 0.23092122205423046 | 0.425 |
| 0.270379578907792 | 0.294 |
| 0.40025985253964386 | 0.239 |
| 0.4913976378114792 | 0.287 |
| 0.37096174477683214 | 0.422 |
| 0.2605524409536775 | 0.47 |
| 0.23856648168964617 | 0.367 |
| 0.3195339820210511 | 0.263 |
| 0.4535244060495409 | 0.252 |
| 0.453879819865963 | 0.343 |
| 0.3133948819899058 | 0.467 |
| 0.2338985632015853 | 0.439 |
| 0.26000622011141067 | 0.308 |
| 0.38175653865926135 | 0.24 |
| 0.49047581179455796 | 0.275 |
| 0.3906253051770131 | 0.405 |
| 0.271357681362596 | 0.475 |
| 0.23431131496653534 | 0.386 |
| 0.30214538602676677 | 0.272 |
| 0.4378584321117157 | 0.246 |
| 0.47032580978354144 | 0.323 |
| 0.32981961235111923 | 0.456 |
| 0.23979661640024266 | 0.452 |
| 0.25166349623187484 | 0.325 |
| 0.36237876691117127 | 0.245 |
| 0.483446935732484 | 0.267 |
| 0.41083571238481553 | 0.387 |
| 0.2828441826443751 | 0.477 |
| 0.23135383684531532 | 0.404 |
| 0.2865216133411371 | 0.281 |
| 0.42162604266358056 | 0.241 |
| 0.4832654102403756 | 0.305 |
| 0.34763557294635367 | 0.442 |
| 0.24814305243341625 | 0.461 |
| 0.24504993664610644 | 0.343 |
| 0.34282134003085585 | 0.253 |
| 0.47167647230801973 | 0.26 |
| 0.43079238055791547 | 0.367 |
| 0.295465723862442 | 0.475 |
| 0.23066081159552473 | 0.421 |
| 0.27320509816587324 | 0.291 |
| 0.40452458861060475 | 0.239 |
| 0.4906222367941011 | 0.29 |
| 0.36636222411049457 | 0.426 |
| 0.25804801043880965 | 0.469 |
| 0.23971193381015 | 0.363 |
| 0.32390620371762485 | 0.261 |
| 0.4571891586679686 | 0.254 |
| 0.4496073130808589 | 0.348 |
| 0.309712586489077 | 0.469 |
| 0.23290915460019482 | 0.436 |
| 0.2622955810824492 | 0.305 |
| 0.38628912023171214 | 0.24 |
| 0.4912898185733956 | 0.278 |
| 0.38584514318618596 | 0.409 |
| 0.26871636664275494 | 0.474 |
| 0.23524318385378998 | 0.382 |
| 0.3061742593206396 | 0.27 |
| 0.44165981278634475 | 0.248 |
| 0.46662858034723775 | 0.328 |
| 0.32573710690710744 | 0.459 |
| 0.23813480394241077 | 0.449 |
| 0.2534933435323469 | 0.321 |
| 0.36707132706956164 | 0.244 |
| 0.4856279847666218 | 0.268 |
| 0.4059768043628151 | 0.391 |
| 0.280008753394516 | 0.476 |
| 0.231894340826373 | 0.4 |
| 0.29007268391631824 | 0.278 |
| 0.4255811535025134 | 0.242 |
| 0.48059867402714046 | 0.309 |
| 0.3432675118370333 | 0.446 |
| 0.2459622913696889 | 0.459 |
| 0.2464982005229165 | 0.339 |
| 0.34747848704504375 | 0.251 |
| 0.4748268719088359 | 0.261 |
| 0.4260858615800201 | 0.372 |
| 0.29230736679188685 | 0.476 |
| 0.23057284361584007 | 0.417 |
| 0.2761710231094455 | 0.289 |
| 0.4087219887208642 | 0.239 |
| 0.48945487950922706 | 0.293 |
| 0.36180560329446004 | 0.43 |
| 0.25558381775663197 | 0.467 |
| 0.24090383058195733 | 0.358 |
| 0.3283468676965368 | 0.259 |
| 0.46080057172466504 | 0.255 |
| 0.44523505519864803 | 0.353 |
| 0.30613438476045307 | 0.471 |
| 0.23209213398707734 | 0.432 |
| 0.2647054164939505 | 0.301 |
| 0.3907631665687657 | 0.239 |
| 0.49173748320838545 | 0.28 |
| 0.38110559826907836 | 0.414 |
| 0.26610854895061975 | 0.473 |
| 0.23623588017285033 | 0.377 |
| 0.3102955448512491 | 0.267 |
| 0.44543272787224214 | 0.249 |
| 0.46276107120322424 | 0.333 |
| 0.32174248356629465 | 0.462 |
| 0.236624779928672 | 0.446 |
| 0.2554276139171325 | 0.317 |
| 0.37174100223190626 | 0.243 |
| 0.4875097932519767 | 0.27 |
| 0.4011181154577022 | 0.396 |
| 0.27723038180467174 | 0.476 |
| 0.23255183466884952 | 0.396 |
| 0.2937519323162922 | 0.276 |
| 0.42949180463616304 | 0.243 |
| 0.47763508094472773 | 0.314 |
| 0.3389557913538717 | 0.449 |
| 0.2438853413181836 | 0.457 |
| 0.2480278026856452 | 0.334 |
| 0.35216351739964485 | 0.249 |
| 0.4777916798191292 | 0.263 |
| 0.42132181996729856 | 0.377 |
| 0.289238275743104 | 0.476 |
| 0.23065170387166925 | 0.413 |
| 0.2792796481913065 | 0.286 |
| 0.412854324865882 | 0.24 |
| 0.48790153980113266 | 0.297 |
| 0.3572912464498541 | 0.434 |
| 0.2531681820904774 | 0.466 |
| 0.24214619343823204 | 0.354 |
| 0.3328508098814719 | 0.257 |
| 0.464341275163796 | 0.256 |
| 0.440771208887124 | 0.357 |
| 0.3026605189315999 | 0.472 |
| 0.23144991624859823 | 0.429 |
| 0.26724070997962907 | 0.298 |
| 0.395173920854326 | 0.239 |
| 0.49180764912857905 | 0.283 |
| 0.3764097599159134 | 0.418 |
| 0.26353225145651304 | 0.472 |
| 0.2372811406695997 | 0.373 |
| 0.3145021295828806 | 0.265 |
| 0.44917677802714484 | 0.25 |
| 0.45874683967138274 | 0.337 |
| 0.3178417675366195 | 0.464 |
| 0.23527343388809152 | 0.443 |
| 0.257469874826742 | 0.313 |
| 0.3763770916183858 | 0.241 |
| 0.4890726550191971 | 0.273 |
| 0.39627292705341705 | 0.4 |
| 0.27450173554328783 | 0.476 |
| 0.23331116447555714 | 0.392 |
| 0.2975510839253606 | 0.274 |
| 0.4333633675906823 | 0.245 |
| 0.47440608620761177 | 0.318 |
| 0.3347077551596575 | 0.453 |
| 0.24192622717009515 | 0.455 |
| 0.24964586964000465 | 0.33 |
| 0.35686447394917564 | 0.247 |
| 0.4805399807586656 | 0.265 |
| 0.4165125221587894 | 0.381 |
| 0.2862514184635247 | 0.477 |
| 0.23088897832420757 | 0.409 |
| 0.28253114516321454 | 0.283 |
| 0.4169253088999573 | 0.24 |
| 0.48597457956735385 | 0.3 |
| 0.35281972778655474 | 0.438 |
| 0.2508119855156086 | 0.464 |
| 0.24344512022330642 | 0.349 |
| 0.3374119059446707 | 0.255 |
| 0.4677890076171307 | 0.258 |
| 0.43622272602792467 | 0.362 |
| 0.2992897511500509 | 0.474 |
| 0.23098375343252053 | 0.425 |
| 0.26990670084432233 | 0.295 |
| 0.3995182405751407 | 0.239 |
| 0.4914915553505796 | 0.286 |
| 0.37175857723454936 | 0.422 |
| 0.26098752687119475 | 0.47 |
| 0.23837368500955286 | 0.368 |
| 0.3187879848751102 | 0.263 |
| 0.45288862410714503 | 0.252 |
| 0.4546050962213731 | 0.342 |
| 0.3140396890188548 | 0.467 |
| 0.2340862006597851 | 0.44 |
| 0.25962363335751326 | 0.309 |
| 0.3809701782522129 | 0.241 |
| 0.49029950074826845 | 0.275 |
| 0.39145257382418447 | 0.404 |
| 0.2718163634837222 | 0.475 |
| 0.23415767430709875 | 0.387 |
| 0.3014611941819739 | 0.272 |
| 0.43720053970650813 | 0.246 |
| 0.47094362916275945 | 0.323 |
| 0.33053132691501946 | 0.456 |
| 0.24009764207571804 | 0.452 |
| 0.2513585050378993 | 0.326 |
| 0.3615688539443122 | 0.246 |
| 0.48304257726680866 | 0.266 |
| 0.4116717938562623 | 0.386 |
| 0.28333901349938045 | 0.477 |
| 0.23127362495027162 | 0.405 |
| 0.2859232997589515 | 0.281 |
| 0.42093974143396956 | 0.241 |
| 0.4836926829229813 | 0.304 |
| 0.34839333204673006 | 0.442 |
| 0.24852817373983843 | 0.462 |
| 0.24480807095755314 | 0.344 |
| 0.34202262441362197 | 0.253 |
| 0.4711172652496717 | 0.259 |
| 0.4315966399652269 | 0.367 |
| 0.29601932131429626 | 0.475 |
| 0.23069326597934842 | 0.422 |
| 0.27270839004735326 | 0.292 |
| 0.4037946872636539 | 0.239 |
| 0.490783845562259 | 0.289 |
| 0.3671515550713672 | 0.426 |
| 0.25847680240307624 | 0.469 |
| 0.23951135499635595 | 0.364 |
| 0.32314792947934184 | 0.261 |
| 0.45656117979695293 | 0.253 |
| 0.4503507641283364 | 0.347 |
| 0.31033959001157513 | 0.469 |
| 0.23306740295235928 | 0.436 |
| 0.2618927048737375 | 0.305 |
| 0.38551225114365884 | 0.24 |
| 0.4911753596377806 | 0.277 |
| 0.3866659112337773 | 0.409 |
| 0.2691689493351069 | 0.474 |
| 0.2350780290241114 | 0.383 |
| 0.30547334904752066 | 0.27 |
| 0.44100695515962973 | 0.247 |
| 0.4672784101751772 | 0.327 |
| 0.3264343728253827 | 0.459 |
| 0.23841050060976265 | 0.449 |
| 0.2531707508766418 | 0.321 |
| 0.3662641949134767 | 0.244 |
| 0.4852729693265035 | 0.268 |
| 0.40681428847457995 | 0.39 |
| 0.2804929664279979 | 0.476 |
| 0.231792458472088 | 0.401 |
| 0.28945154227583814 | 0.279 |
| 0.42490308149611533 | 0.242 |
| 0.4810801248797784 | 0.309 |
| 0.3440162268995349 | 0.445 |
| 0.2463310022880437 | 0.46 |
| 0.24624310184984272 | 0.34 |
| 0.34667383242877675 | 0.251 |
| 0.4742964696670619 | 0.261 |
| 0.4269011292689914 | 0.371 |
| 0.2928449524625622 | 0.476 |
| 0.23057591197728955 | 0.418 |
| 0.2756499092791191 | 0.289 |
| 0.4080035705164645 | 0.239 |
| 0.4896837622870297 | 0.293 |
| 0.36258761205935086 | 0.43 |
| 0.25600516034076576 | 0.467 |
| 0.2406950308885765 | 0.359 |
| 0.3275771521049368 | 0.259 |
| 0.4601828802724992 | 0.255 |
| 0.44599505568053993 | 0.352 |
| 0.30674339693075053 | 0.471 |
| 0.23222048377467053 | 0.433 |
| 0.2642814418983289 | 0.302 |
| 0.3899967648454526 | 0.239 |
| 0.4916869892590787 | 0.28 |
| 0.3819190804679474 | 0.413 |
| 0.26655555294220923 | 0.473 |
| 0.23606091399994136 | 0.378 |
| 0.30957925175244533 | 0.268 |
| 0.4447847327816812 | 0.249 |
| 0.46343844083957114 | 0.332 |
| 0.32242414568173167 | 0.461 |
| 0.23687378893894376 | 0.446 |
| 0.255086768600817 | 0.317 |
| 0.37093860865287825 | 0.243 |
| 0.48720781837705307 | 0.27 |
| 0.4019545712143185 | 0.395 |
| 0.2777053078674488 | 0.476 |
| 0.2324308779861825 | 0.397 |
| 0.29310926819639066 | 0.277 |
| 0.4288209962214045 | 0.243 |
| 0.47816547352080835 | 0.313 |
| 0.33969430221512126 | 0.449 |
| 0.2442351397716872 | 0.457 |
| 0.24775815713765575 | 0.335 |
| 0.3513548875852147 | 0.249 |
| 0.4772954847248686 | 0.263 |
| 0.42214617482783445 | 0.376 |
| 0.28976095676711755 | 0.476 |
| 0.2306265528369633 | 0.414 |
| 0.27873387328537164 | 0.286 |
| 0.41214688767228 | 0.239 |
| 0.48819622026184284 | 0.296 |
| 0.35806597467072004 | 0.434 |
| 0.25358044990932244 | 0.466 |
| 0.24192831387304012 | 0.354 |
| 0.3320705955766269 | 0.257 |
| 0.4637372218441527 | 0.256 |
| 0.44154647615842424 | 0.356 |
| 0.30325160219310127 | 0.472 |
| 0.23154802362437127 | 0.43 |
| 0.2667947494186431 | 0.298 |
| 0.3944186935293063 | 0.239 |
| 0.49182289420073333 | 0.283 |
| 0.37721559256492015 | 0.417 |
| 0.2639738823086081 | 0.472 |
| 0.23709758112750481 | 0.374 |
| 0.3137715994680479 | 0.266 |
| 0.4485339018646752 | 0.25 |
| 0.45944799402123465 | 0.337 |
| 0.3185068759334763 | 0.464 |
| 0.23549468192965795 | 0.443 |
| 0.25711017804266945 | 0.313 |
| 0.3755811935892456 | 0.242 |
| 0.4888269127410686 | 0.272 |
| 0.39710618618938814 | 0.399 |
| 0.274968582735626 | 0.476 |
| 0.23317373307803707 | 0.392 |
| 0.2968883908379939 | 0.274 |
| 0.43269893489621636 | 0.244 |
| 0.4749799161553255 | 0.317 |
| 0.3354347372026925 | 0.452 |
| 0.24225477506090437 | 0.455 |
| 0.2493605175848343 | 0.331 |
| 0.35605398405402494 | 0.247 |
| 0.4800832309504592 | 0.264 |
| 0.41734372376155193 | 0.381 |
| 0.2867604713210186 | 0.476 |
| 0.23083725386873755 | 0.41 |
| 0.28196084596767296 | 0.284 |
| 0.4162281244803167 | 0.24 |
| 0.48633246668943714 | 0.3 |
| 0.3535869645800309 | 0.437 |
| 0.2512131390336155 | 0.464 |
| 0.24321699195538282 | 0.35 |
| 0.33662233875637204 | 0.255 |
| 0.46720275546584483 | 0.258 |
| 0.43701209088226745 | 0.361 |
| 0.2998632264134787 | 0.474 |
| 0.23105150432681557 | 0.426 |
| 0.2694378525808592 | 0.295 |
| 0.398774609812628 | 0.239 |
| 0.49157383809317384 | 0.286 |
| 0.372556721858578 | 0.421 |
| 0.26142361553399746 | 0.471 |
| 0.23818222035464207 | 0.369 |
| 0.3180441858715407 | 0.264 |
| 0.4522516868053022 | 0.252 |
| 0.45532703983226824 | 0.341 |
| 0.31468752634338315 | 0.466 |
| 0.23427883956308845 | 0.44 |
| 0.2592444678978599 | 0.309 |
| 0.3801823001671587 | 0.241 |
| 0.49011276789506986 | 0.274 |
| 0.39228084907471467 | 0.404 |
| 0.27227616895785905 | 0.475 |
| 0.23400622057025416 | 0.388 |
| 0.300780029616422 | 0.272 |
| 0.4365417379958922 | 0.246 |
| 0.47155543686138274 | 0.322 |
| 0.33124540190636925 | 0.455 |
| 0.24040287071524122 | 0.452 |
| 0.2510564725881604 | 0.326 |
| 0.36075867126704086 | 0.246 |
| 0.4826301316339958 | 0.266 |
| 0.41250737756790756 | 0.385 |
| 0.28383581363382554 | 0.477 |
| 0.23119739935471378 | 0.406 |
| 0.2853290304190653 | 0.281 |
| 0.4202519232172616 | 0.241 |
| 0.4841101306803863 | 0.304 |
| 0.3491525499397939 | 0.441 |
| 0.24891586566436688 | 0.462 |
| 0.24456834503078648 | 0.345 |
| 0.3412251142900488 | 0.253 |
| 0.4705536378503489 | 0.259 |
| 0.4323988342628647 | 0.366 |
| 0.296575773422281 | 0.475 |
| 0.2307308655201144 | 0.422 |
| 0.27221583596084137 | 0.292 |
| 0.4030627764407667 | 0.239 |
| 0.49093379437753853 | 0.289 |
| 0.36794216390933127 | 0.425 |
| 0.25890674766259875 | 0.469 |
| 0.23931213510202762 | 0.364 |
| 0.322391712100518 | 0.262 |
| 0.45593170347272616 | 0.253 |
| 0.45109121276506897 | 0.346 |
| 0.31096968104293515 | 0.468 |
| 0.2332307548886927 | 0.437 |
| 0.2614933791000445 | 0.306 |
| 0.3847336699800948 | 0.24 |
| 0.491050085832045 | 0.277 |
| 0.3874878679590115 | 0.408 |
| 0.26962253778543577 | 0.474 |
| 0.23491472396640536 | 0.384 |
| 0.30477521886859865 | 0.27 |
| 0.44035325248762314 | 0.247 |
| 0.4679230622937302 | 0.326 |
| 0.3271342154307973 | 0.458 |
| 0.23869066665359878 | 0.45 |
| 0.25285123964128836 | 0.322 |
| 0.3654564391903321 | 0.244 |
| 0.4849091741242076 | 0.268 |
| 0.40765170942732154 | 0.39 |
| 0.28097891125689706 | 0.476 |
| 0.23169412692750302 | 0.402 |
| 0.2888342474881226 | 0.279 |
| 0.4242236617372406 | 0.242 |
| 0.48155260284059803 | 0.308 |
| 0.3447665766487564 | 0.445 |
| 0.24670272139958457 | 0.46 |
| 0.24599038008029162 | 0.34 |
| 0.3458700665664109 | 0.251 |
| 0.47376071895671845 | 0.261 |
| 0.4277146277083262 | 0.371 |
| 0.29338522339721923 | 0.475 |
| 0.23058397347976428 | 0.418 |
| 0.27513302840788867 | 0.289 |
| 0.4072832026006917 | 0.239 |
| 0.4899011293386091 | 0.292 |
| 0.36337087380935684 | 0.429 |
| 0.2564278895380519 | 0.468 |
| 0.24048769830276778 | 0.36 |
| 0.32680934479784807 | 0.26 |
| 0.4595632015652124 | 0.255 |
| 0.4467523030869259 | 0.351 |
| 0.30735551132054906 | 0.47 |
| 0.23235401432121627 | 0.434 |
| 0.2638611638882465 | 0.302 |
| 0.38922850167962286 | 0.239 |
| 0.49162533799291164 | 0.279 |
| 0.38273385459885345 | 0.412 |
| 0.26700349388170597 | 0.473 |
| 0.23588753704422927 | 0.379 |
| 0.30886552173722326 | 0.268 |
| 0.4441358952483359 | 0.249 |
| 0.4641113545883492 | 0.331 |
| 0.32310856999155535 | 0.461 |
| 0.23712747953246574 | 0.447 |
| 0.25474911112945203 | 0.318 |
| 0.3701352673029623 | 0.243 |
| 0.4868964648618264 | 0.27 |
| 0.40279136779071373 | 0.394 |
| 0.27818174368757614 | 0.476 |
| 0.23231302024672912 | 0.397 |
| 0.2924702092156817 | 0.277 |
| 0.4281490027254403 | 0.243 |
| 0.47868782333300536 | 0.312 |
| 0.340434662329062 | 0.448 |
| 0.24458836939005213 | 0.458 |
| 0.24749110539110603 | 0.336 |
| 0.35054679483094 | 0.249 |
| 0.4767930151373363 | 0.262 |
| 0.42296911582995156 | 0.375 |
| 0.2902861184855084 | 0.476 |
| 0.23060615915522856 | 0.415 |
| 0.27819234884104643 | 0.287 |
| 0.4114376050408469 | 0.239 |
| 0.48847971869204354 | 0.295 |
| 0.35884196407355484 | 0.433 |
| 0.25399441613165835 | 0.466 |
| 0.24171207490934493 | 0.355 |
| 0.33129211500048594 | 0.258 |
| 0.4631305433020092 | 0.256 |
| 0.442319196844148 | 0.356 |
| 0.3038457587282477 | 0.472 |
| 0.23165135684624685 | 0.43 |
| 0.2663526416629438 | 0.299 |
| 0.39366150279543705 | 0.239 |
| 0.4918267054567271 | 0.282 |
| 0.37802275336416147 | 0.416 |
| 0.26441643969757306 | 0.472 |
| 0.236915437922998 | 0.374 |
| 0.31304344869033257 | 0.266 |
| 0.4478901028482777 | 0.25 |
| 0.46014528530251897 | 0.336 |
| 0.31917489407307353 | 0.464 |
| 0.23572077866946833 | 0.444 |
| 0.25675377170113817 | 0.314 |
| 0.3747840610610501 | 0.242 |
| 0.48857127424245106 | 0.272 |
| 0.3979401352923822 | 0.398 |
| 0.27543674252111444 | 0.476 |
| 0.2330389592113749 | 0.393 |
| 0.2962290375628056 | 0.275 |
| 0.4320334616961999 | 0.244 |
| 0.47554665693923526 | 0.317 |
| 0.3361638036686248 | 0.452 |
| 0.24258714006969972 | 0.455 |
| 0.24907794619586943 | 0.331 |
| 0.35524366022988246 | 0.248 |
| 0.4796193261833333 | 0.264 |
| 0.41817391690825695 | 0.38 |
| 0.28727177579356233 | 0.476 |
| 0.2307899706132927 | 0.411 |
| 0.281394743952303 | 0.284 |
| 0.4155292334427991 | 0.24 |
| 0.48667969655404847 | 0.299 |
| 0.3543555204124393 | 0.437 |
| 0.2516163678207231 | 0.464 |
| 0.2429907222380805 | 0.351 |
| 0.3358342901869008 | 0.256 |
| 0.46661310836654285 | 0.257 |
| 0.4377991122282697 | 0.36 |
| 0.3004397008960478 | 0.473 |
| 0.23112448060293322 | 0.427 |
| 0.26897300955455544 | 0.296 |
| 0.3980289639211804 | 0.239 |
| 0.49164450520365577 | 0.285 |
| 0.37335618354550937 | 0.42 |
| 0.2618606891976391 | 0.471 |
| 0.23799209209908415 | 0.37 |
| 0.31730261001865395 | 0.264 |
| 0.4516136390413525 | 0.251 |
| 0.4560455832257096 | 0.341 |
| 0.3153383798545437 | 0.466 |
| 0.23447645986199903 | 0.441 |
| 0.2588687032691478 | 0.31 |
| 0.3793929423239956 | 0.241 |
| 0.4899156858340289 | 0.274 |
| 0.3931100912710419 | 0.403 |
| 0.2727371223633588 | 0.475 |
| 0.23385701846068427 | 0.389 |
| 0.30010193724344 | 0.273 |
| 0.43588201098939133 | 0.246 |
| 0.4721610799707235 | 0.321 |
| 0.3319617977771332 | 0.455 |
| 0.24071225056466777 | 0.453 |
| 0.2507573752963582 | 0.327 |
| 0.35994828200254664 | 0.246 |
| 0.48220972793497624 | 0.266 |
| 0.4133423875830604 | 0.384 |
| 0.2843346247028174 | 0.477 |
| 0.23112523148967878 | 0.407 |
| 0.28473883354338836 | 0.282 |
| 0.41956255910335605 | 0.241 |
| 0.48451761841510127 | 0.303 |
| 0.3499132012950859 | 0.441 |
| 0.24930605328146158 | 0.462 |
| 0.24433071708884646 | 0.346 |
| 0.3404288598272307 | 0.254 |
| 0.4699857466724229 | 0.259 |
| 0.4331989183699399 | 0.365 |
| 0.29713510524197445 | 0.474 |
| 0.23077362826785022 | 0.423 |
| 0.2717274172112517 | 0.293 |
| 0.4023288508409187 | 0.239 |
| 0.4910720762895801 | 0.288 |
| 0.3687340565943344 | 0.424 |
| 0.25933781439054104 | 0.469 |
| 0.2391142633451431 | 0.365 |
| 0.3216375758978173 | 0.262 |
| 0.4553007989173684 | 0.253 |
| 0.4518286088311196 | 0.345 |
| 0.31160285273656624 | 0.468 |
| 0.2333991945108697 | 0.438 |
| 0.26109758022154816 | 0.306 |
| 0.38395340707296405 | 0.24 |
| 0.4909140614588555 | 0.276 |
| 0.38831098780569706 | 0.407 |
| 0.2700771490182609 | 0.474 |
| 0.2347533216947203 | 0.384 |
| 0.30407990943665214 | 0.271 |
| 0.4396986975655745 | 0.247 |
| 0.4685624003197446 | 0.326 |
| 0.3278365993834996 | 0.458 |
| 0.23897526023097465 | 0.45 |
| 0.25253479017932867 | 0.323 |
| 0.3646481190353835 | 0.245 |
| 0.4845367115906517 | 0.268 |
| 0.4084889937770577 | 0.389 |
| 0.2814666279909175 | 0.477 |
| 0.23159942313936732 | 0.402 |
| 0.28822083725406 | 0.28 |
| 0.4235428652004538 | 0.242 |
| 0.48201595405649766 | 0.307 |
| 0.34551852757514423 | 0.444 |
| 0.24707737364536989 | 0.46 |
| 0.24573999541945923 | 0.341 |
| 0.34506724689360907 | 0.252 |
| 0.47321978085932365 | 0.26 |
| 0.428526301622432 | 0.37 |
| 0.29392821153455867 | 0.475 |
| 0.2305970602294567 | 0.419 |
| 0.274620370898972 | 0.29 |
| 0.406560871282354 | 0.239 |
| 0.4901069426540574 | 0.291 |
| 0.36415539106230704 | 0.428 |
| 0.25685195932259286 | 0.468 |
| 0.2402818090094481 | 0.361 |
| 0.3260434727346383 | 0.26 |
| 0.45894163074481936 | 0.254 |
| 0.4475067586356524 | 0.35 |
| 0.3079707284668462 | 0.47 |
| 0.2324927143250427 | 0.434 |
| 0.26344455627743435 | 0.303 |
| 0.3884583995026307 | 0.239 |
| 0.49155258432573185 | 0.279 |
| 0.3835499080922815 | 0.411 |
| 0.2674523797469758 | 0.473 |
| 0.23571578818217248 | 0.38 |
| 0.3081543897940135 | 0.269 |
| 0.44348622009651906 | 0.248 |
| 0.46477969701846367 | 0.33 |
| 0.3237957271015788 | 0.461 |
| 0.23738581866200886 | 0.447 |
| 0.25441462379346674 | 0.319 |
| 0.3693310315271827 | 0.243 |
| 0.48657582964264795 | 0.269 |
| 0.4036284388972396 | 0.393 |
| 0.27865972597997685 | 0.476 |
| 0.232198339291199 | 0.398 |
| 0.29183479930547573 | 0.277 |
| 0.4274757971028903 | 0.243 |
| 0.4792019669342736 | 0.311 |
| 0.3411768327208531 | 0.448 |
| 0.24494495940063737 | 0.458 |
| 0.24722661204134672 | 0.337 |
| 0.3497393015832028 | 0.25 |
| 0.4762844284386269 | 0.262 |
| 0.4237905777497158 | 0.374 |
| 0.290813798225378 | 0.476 |
| 0.23059056940174721 | 0.415 |
| 0.27765507673363504 | 0.287 |
| 0.41072645622243437 | 0.239 |
| 0.48875196376300545 | 0.295 |
| 0.35961921005328235 | 0.432 |
| 0.25441002191319134 | 0.466 |
| 0.2414974428620594 | 0.356 |
| 0.3305154007907987 | 0.258 |
| 0.46252135952107426 | 0.256 |
| 0.4430893366756459 | 0.355 |
| 0.30444299670424857 | 0.472 |
| 0.2317599109600824 | 0.431 |
| 0.2659143596065024 | 0.3 |
| 0.3929023627138471 | 0.239 |
| 0.4918191247180383 | 0.282 |
| 0.3788312400828702 | 0.416 |
| 0.2648599207966036 | 0.472 |
| 0.23673473428095226 | 0.375 |
| 0.31231770667383785 | 0.266 |
| 0.4472454017879191 | 0.25 |
| 0.46083862082841914 | 0.335 |
| 0.31984579941856855 | 0.463 |
| 0.23595169805673963 | 0.444 |
| 0.25640063786244677 | 0.315 |
| 0.3739857405481297 | 0.242 |
| 0.488305823625421 | 0.272 |
| 0.398774718976496 | 0.398 |
| 0.2759062467470725 | 0.476 |
| 0.23290691705226535 | 0.394 |
| 0.2955730705507752 | 0.275 |
| 0.43136692485449984 | 0.244 |
| 0.47610614494615594 | 0.316 |
| 0.3368949134216712 | 0.451 |
| 0.24292325909882445 | 0.456 |
| 0.24879812561615425 | 0.332 |
| 0.3544335670032419 | 0.248 |
| 0.4791484133332309 | 0.264 |
| 0.4190030289766317 | 0.379 |
| 0.28778537254952086 | 0.476 |
| 0.23074718830237506 | 0.411 |
| 0.28083285348872433 | 0.285 |
| 0.414828609936159 | 0.24 |
| 0.4870161656867048 | 0.299 |
| 0.35512538134272936 | 0.436 |
| 0.2520216031584912 | 0.465 |
| 0.24276627134692155 | 0.351 |
| 0.3350478006121838 | 0.256 |
| 0.46602020708901865 | 0.257 |
| 0.4385837537398828 | 0.36 |
| 0.3010191906141807 | 0.473 |
| 0.23120268628990326 | 0.427 |
| 0.26851214654274574 | 0.296 |
| 0.39728130812254814 | 0.239 |
| 0.4917035797258871 | 0.284 |
| 0.374156966530528 | 0.42 |
| 0.26229873244373453 | 0.471 |
| 0.23780330735516922 | 0.371 |
| 0.3165632827585558 | 0.264 |
| 0.45097452183247294 | 0.251 |
| 0.4567606554761384 | 0.34 |
| 0.31599223419689576 | 0.466 |
| 0.23467904073853302 | 0.441 |
| 0.25849631948839924 | 0.311 |
| 0.37860214392766345 | 0.241 |
| 0.4897083286694798 | 0.274 |
| 0.3939402583341669 | 0.402 |
| 0.2731992494493396 | 0.475 |
| 0.2337101343875959 | 0.389 |
| 0.2994269624707886 | 0.273 |
| 0.43522134145364266 | 0.245 |
| 0.4727604033556068 | 0.32 |
| 0.3326804744940324 | 0.454 |
| 0.2410257281345771 | 0.453 |
| 0.25046118873623424 | 0.328 |
| 0.3591377497224061 | 0.246 |
| 0.4817814980942565 | 0.265 |
| 0.41417674803712207 | 0.384 |
| 0.28483548841388423 | 0.477 |
| 0.231057191394552 | 0.407 |
| 0.2841527354600031 | 0.282 |
| 0.4188716204295829 | 0.241 |
| 0.48491501509769414 | 0.302 |
| 0.3506752623851309 | 0.44 |
| 0.24969866217230885 | 0.463 |
| 0.2440951453350202 | 0.347 |
| 0.3396339097920332 | 0.254 |
| 0.469413746641723 | 0.259 |
| 0.433996848795592 | 0.364 |
| 0.29769734054289465 | 0.474 |
| 0.23082157000702125 | 0.424 |
| 0.27124311384787947 | 0.293 |
| 0.4015929066878442 | 0.239 |
| 0.4911986892563407 | 0.288 |
| 0.36952723924687614 | 0.424 |
| 0.2597699732316041 | 0.47 |
| 0.2389177314360527 | 0.366 |
| 0.3208855450724846 | 0.262 |
| 0.45466853098466264 | 0.253 |
| 0.45256289956410123 | 0.345 |
| 0.31223909698983937 | 0.468 |
| 0.2335727052121546 | 0.438 |
| 0.2607052852343548 | 0.307 |
| 0.38317149407921763 | 0.24 |
| 0.4907673522537464 | 0.276 |
| 0.38913524282224127 | 0.406 |
| 0.2705328014576058 | 0.474 |
| 0.23459387743610766 | 0.385 |
| 0.3033874622780422 | 0.271 |
| 0.4390432814661397 | 0.247 |
| 0.4691962846383754 | 0.325 |
| 0.32854148846996584 | 0.457 |
| 0.23926423784213477 | 0.451 |
| 0.25222138229554925 | 0.324 |
| 0.36383929442169427 | 0.245 |
| 0.4841556970030295 | 0.267 |
| 0.4093260673012522 | 0.388 |
| 0.28195615714881933 | 0.477 |
| 0.23150842342802555 | 0.403 |
| 0.2876113478512104 | 0.28 |
| 0.4228606627244931 | 0.242 |
| 0.4824700272775482 | 0.306 |
| 0.3462720474111038 | 0.444 |
| 0.24745488365482818 | 0.461 |
| 0.24549190752715977 | 0.342 |
| 0.3442654297276134 | 0.252 |
| 0.47267381628439725 | 0.26 |
| 0.4293360975460674 | 0.369 |
| 0.29447394771531643 | 0.475 |
| 0.23061520183533382 | 0.42 |
| 0.27411192538740803 | 0.29 |
| 0.40583656424128717 | 0.239 |
| 0.4903011698240551 | 0.291 |
| 0.3649411672252433 | 0.428 |
| 0.2572773260610616 | 0.468 |
| 0.24007734123873714 | 0.361 |
| 0.32527956218509757 | 0.26 |
| 0.4583182584825976 | 0.254 |
| 0.4482583820628732 | 0.349 |
| 0.30858904761963846 | 0.47 |
| 0.232636571601067 | 0.435 |
| 0.2630315932474328 | 0.303 |
| 0.3876864821368732 | 0.239 |
| 0.49146878498542673 | 0.279 |
| 0.38436722629020026 | 0.411 |
| 0.26790222019392 | 0.474 |
| 0.2355457088612264 | 0.381 |
| 0.3074458919232429 | 0.269 |
| 0.44283570981273723 | 0.248 |
| 0.4654433488847883 | 0.33 |
| 0.32448558650734927 | 0.46 |
| 0.2376487718828925 | 0.448 |
| 0.25408328870603464 | 0.319 |
| 0.36852595576205743 | 0.243 |
| 0.4862460121618324 | 0.269 |
| 0.40446571671219494 | 0.393 |
| 0.27913929215908423 | 0.476 |
| 0.232086913138941 | 0.399 |
| 0.29120308158311414 | 0.278 |
| 0.42680135182701234 | 0.243 |
| 0.47970774185111853 | 0.311 |
| 0.34192077512970853 | 0.447 |
| 0.24530483801489947 | 0.459 |
| 0.24696464080840375 | 0.337 |
| 0.3489324696225986 | 0.25 |
| 0.47576988318765023 | 0.262 |
| 0.42461049695224434 | 0.374 |
| 0.29134403251928015 | 0.476 |
| 0.23057982770371033 | 0.416 |
| 0.27712205674691587 | 0.288 |
| 0.4100134215586776 | 0.239 |
| 0.4890128899022529 | 0.294 |
| 0.36039770943623545 | 0.432 |
| 0.25482721044957185 | 0.467 |
| 0.24128438548587705 | 0.357 |
| 0.3297404844257449 | 0.258 |
| 0.461909786412603 | 0.255 |
| 0.4438568610993295 | 0.354 |
| 0.30504332295410247 | 0.471 |
| 0.23187367974666065 | 0.431 |
| 0.2654798761269469 | 0.3 |
| 0.3921412888246459 | 0.239 |
| 0.49180019642636513 | 0.281 |
| 0.37964104895652745 | 0.415 |
| 0.2653043247718953 | 0.472 |
| 0.23655549618662478 | 0.376 |
| 0.31159440372734803 | 0.267 |
| 0.4465998164369199 | 0.249 |
| 0.4615279039865357 | 0.334 |
| 0.32051956821634553 | 0.463 |
| 0.2361874129716474 | 0.445 |
| 0.2560507587722612 | 0.315 |
| 0.3731862797876174 | 0.242 |
| 0.4880306469876572 | 0.271 |
| 0.3996098797644343 | 0.397 |
| 0.2763771281911817 | 0.476 |
| 0.23277768171767269 | 0.395 |
| 0.29492053608467395 | 0.276 |
| 0.43069930042525234 | 0.244 |
| 0.47665821594158714 | 0.315 |
| 0.33762802545706666 | 0.45 |
| 0.24326306754684046 | 0.456 |
| 0.24852102500714732 | 0.333 |
| 0.3536237687627649 | 0.248 |
| 0.47867064147722127 | 0.263 |
| 0.41983098835667076 | 0.378 |
| 0.2883013018430178 | 0.476 |
| 0.2307089645770036 | 0.412 |
| 0.2802751867901167 | 0.285 |
| 0.41412622882992656 | 0.24 |
| 0.4873417759135086 | 0.298 |
| 0.35589653512073866 | 0.435 |
| 0.25242877775932615 | 0.465 |
| 0.24254360031142688 | 0.352 |
| 0.3342629089861472 | 0.256 |
| 0.4654241892331886 | 0.257 |
| 0.4393659798635695 | 0.359 |
| 0.3016017102261117 | 0.473 |
| 0.2312861236643521 | 0.428 |
| 0.26805523776516843 | 0.297 |
| 0.396531649185684 | 0.239 |
| 0.49175108839182946 | 0.284 |
| 0.37495907424974734 | 0.419 |
| 0.26273773213860163 | 0.471 |
| 0.23761587599427753 | 0.371 |
| 0.31582623004997407 | 0.265 |
| 0.4503343724260619 | 0.251 |
| 0.4574721820972584 | 0.339 |
| 0.3166490727698996 | 0.465 |
| 0.23488656057466065 | 0.442 |
| 0.2581272970230798 | 0.311 |
| 0.3778099454618125 | 0.241 |
| 0.4894907720620441 | 0.273 |
| 0.3947713057881692 | 0.401 |
| 0.27366257709983954 | 0.475 |
| 0.2335656363630867 | 0.39 |
| 0.2987551511152767 | 0.273 |
| 0.4345597109829618 | 0.245 |
| 0.4733532498647973 | 0.319 |
| 0.33340139161987664 | 0.454 |
| 0.2413432482110079 | 0.454 |
| 0.25016788760508485 | 0.329 |
| 0.3583271383673509 | 0.247 |
| 0.4813455768101789 | 0.265 |
| 0.41501038328465023 | 0.383 |
| 0.2853384464602461 | 0.477 |
| 0.23099334759650209 | 0.408 |
| 0.28357076054269237 | 0.283 |
| 0.4181790788498703 | 0.24 |
| 0.48530219398717805 | 0.302 |
| 0.35143871112341984 | 0.439 |
| 0.25009361856772794 | 0.463 |
| 0.24386158805878091 | 0.347 |
| 0.33884031152552224 | 0.254 |
| 0.4688377908015429 | 0.258 |
| 0.43479258355482936 | 0.363 |
| 0.29826250178854324 | 0.474 |
| 0.2308747043196131 | 0.424 |
| 0.2707629047644352 | 0.294 |
| 0.40085494174316594 | 0.239 |
| 0.491313635983711 | 0.287 |
| 0.3703217179996486 | 0.423 |
| 0.2602031972907674 | 0.47 |
| 0.23872253363481302 | 0.367 |
| 0.32013564381041265 | 0.263 |
| 0.454034960221195 | 0.252 |
| 0.4532940294287256 | 0.344 |
| 0.31287840444678483 | 0.467 |
| 0.2337512696833813 | 0.439 |
| 0.26031647167631744 | 0.308 |
| 0.38238796397260216 | 0.24 |
| 0.49061002536710996 | 0.276 |
| 0.389960602636694 | 0.406 |
| 0.27098951488434575 | 0.475 |
| 0.23443644855331006 | 0.386 |
| 0.30269791974319604 | 0.271 |
| 0.4383869936314779 | 0.246 |
| 0.46982457254796606 | 0.324 |
| 0.3292488456591133 | 0.457 |
| 0.2395575543014907 | 0.451 |
| 0.25191099518826754 | 0.324 |
| 0.3630300261024474 | 0.245 |
| 0.48376624851096983 | 0.267 |
| 0.41016285514173356 | 0.387 |
| 0.282447539601389 | 0.477 |
| 0.23142120335006627 | 0.404 |
| 0.2870058140401784 | 0.28 |
| 0.4221770250756047 | 0.241 |
| 0.48291467412698397 | 0.306 |
| 0.3470271052080864 | 0.443 |
| 0.24783517588209394 | 0.461 |
| 0.24524607559583253 | 0.343 |
| 0.34346467020410154 | 0.252 |
| 0.47212298571870476 | 0.26 |
| 0.4301439638191313 | 0.368 |
| 0.29502246164105017 | 0.475 |
| 0.23063842543051785 | 0.42 |
| 0.2736076788174462 | 0.291 |
| 0.40511027056437643 | 0.239 |
| 0.49048378395473485 | 0.29 |
| 0.3657282064780454 | 0.427 |
| 0.25770394854521295 | 0.469 |
| 0.23987427535596456 | 0.362 |
| 0.3245176388243774 | 0.261 |
| 0.45769317096300816 | 0.254 |
| 0.44900713141859905 | 0.348 |
| 0.309210466749069 | 0.469 |
| 0.2327855731274964 | 0.435 |
| 0.26262224939283635 | 0.304 |
| 0.3869127747821898 | 0.24 |
| 0.49137399841338747 | 0.278 |
| 0.3851857923741816 | 0.41 |
| 0.26835302650492115 | 0.474 |
| 0.2353773430496183 | 0.381 |
| 0.306740065132329 | 0.269 |
| 0.4421843646609322 | 0.248 |
| 0.4661021871958038 | 0.329 |
| 0.3251781166245393 | 0.46 |
| 0.23791630329989205 | 0.448 |
| 0.2537550877372206 | 0.32 |
| 0.3677200955015069 | 0.244 |
| 0.48590711444468804 | 0.269 |
| 0.4053031320000069 | 0.392 |
| 0.27962048029364067 | 0.476 |
| 0.23197881985035482 | 0.4 |
| 0.29057509824141464 | 0.278 |
| 0.4261256389469601 | 0.242 |
| 0.4802049868670993 | 0.31 |
| 0.34266645210693414 | 0.446 |
| 0.24566793253656669 | 0.459 |
| 0.24670515457811767 | 0.338 |
| 0.34812635997776864 | 0.25 |
| 0.4752495389059247 | 0.261 |
| 0.425428811458473 | 0.373 |
| 0.2918768570460406 | 0.476 |
| 0.23057397571019717 | 0.417 |
| 0.2765932866118003 | 0.288 |
| 0.4092984825380664 | 0.239 |
| 0.48926243730999075 | 0.294 |
| 0.3611774604051845 | 0.431 |
| 0.2552459270568382 | 0.467 |
| 0.24107287208784356 | 0.358 |
| 0.32896739629241917 | 0.259 |
| 0.4612959357092948 | 0.255 |
| 0.44462173507453645 | 0.353 |
| 0.3056467429845023 | 0.471 |
| 0.23199265579855327 | 0.432 |
| 0.26504916416520147 | 0.301 |
| 0.3913782981316464 | 0.239 |
| 0.491769967479518 | 0.281 |
| 0.3804521745761008 | 0.414 |
| 0.26574965272783035 | 0.473 |
| 0.23637775236599043 | 0.377 |
| 0.31087357108479613 | 0.267 |
| 0.4459533616193878 | 0.249 |
| 0.4622130342236508 | 0.333 |
| 0.32119617550712326 | 0.462 |
| 0.2364278951694148 | 0.445 |
| 0.25570411680368377 | 0.316 |
| 0.37238572772379025 | 0.242 |
| 0.48774583251222275 | 0.271 |
| 0.4004455581670143 | 0.396 |
| 0.27684942052477174 | 0.476 |
| 0.2326513291394852 | 0.395 |
| 0.29427148016983684 | 0.276 |
| 0.43003056371015475 | 0.244 |
| 0.4772027053342959 | 0.314 |
| 0.3383630990006851 | 0.45 |
| 0.24360649937421602 | 0.457 |
| 0.24824661255112507 | 0.334 |
| 0.35281432966728565 | 0.249 |
| 0.47818616174694184 | 0.263 |
| 0.42065772456972084 | 0.377 |
| 0.28881960344535396 | 0.476 |
| 0.2306753548957237 | 0.413 |
| 0.2797217539031165 | 0.286 |
| 0.41342206578218427 | 0.24 |
| 0.4876564344823555 | 0.297 |
| 0.3566689711646622 | 0.435 |
| 0.2528378258867863 | 0.465 |
| 0.24232267103482596 | 0.353 |
| 0.33347965286811293 | 0.257 |
| 0.4648251890413743 | 0.257 |
| 0.44014575565484837 | 0.358 |
| 0.30218727303204135 | 0.473 |
| 0.23137479333600983 | 0.428 |
| 0.2676022569844419 | 0.297 |
| 0.39577999541890546 | 0.239 |
| 0.49178706142997236 | 0.283 |
| 0.37576250920490223 | 0.418 |
| 0.2631776773884721 | 0.471 |
| 0.23742981066161908 | 0.372 |
| 0.31509147844610297 | 0.265 |
| 0.4496932244152911 | 0.251 |
| 0.458180084946665 | 0.338 |
| 0.3173088777298719 | 0.465 |
| 0.23509899691554076 | 0.442 |
| 0.2577616167559773 | 0.312 |
| 0.37701638868196646 | 0.241 |
| 0.48926309328869577 | 0.273 |
| 0.39560318679317513 | 0.401 |
| 0.27412713329852967 | 0.475 |
| 0.23342359389662642 | 0.391 |
| 0.2980865493124897 | 0.274 |
| 0.4338971000669949 | 0.245 |
| 0.47393946055113895 | 0.319 |
| 0.33412450839862434 | 0.453 |
| 0.2416647538740408 | 0.454 |
| 0.24987744569221923 | 0.329 |
| 0.3575165121650716 | 0.247 |
| 0.4809021014908318 | 0.265 |
| 0.41584321804465546 | 0.382 |
| 0.2858435404530426 | 0.477 |
| 0.2309337669946089 | 0.409 |
| 0.2829929311574742 | 0.283 |
| 0.4174849064044085 | 0.24 |
| 0.48567903283932357 | 0.301 |
| 0.35220352709421016 | 0.439 |
| 0.25049084948977596 | 0.463 |
| 0.24363000374517924 | 0.348 |
| 0.3380481109248674 | 0.255 |
| 0.4682580300718286 | 0.258 |
| 0.43558608207125404 | 0.363 |
| 0.2988306101199545 | 0.474 |
| 0.23093304265358178 | 0.425 |
| 0.270286767800962 | 0.294 |
| 0.40011495531580926 | 0.239 |
| 0.4914169237562746 | 0.286 |
| 0.3711174988576869 | 0.422 |
| 0.26063746211569105 | 0.47 |
| 0.23852866680234275 | 0.368 |
| 0.3193878963807542 | 0.263 |
| 0.4534001429381965 | 0.252 |
| 0.4540219399554027 | 0.343 |
| 0.3135207645001641 | 0.467 |
| 0.2339348699118595 | 0.439 |
| 0.2599311176262054 | 0.308 |
| 0.381602851036209 | 0.24 |
| 0.4904421493595987 | 0.275 |
| 0.390787034440282 | 0.405 |
| 0.27144731039507064 | 0.475 |
| 0.23428109446306497 | 0.387 |
| 0.3020113249501015 | 0.272 |
| 0.43772982196122107 | 0.246 |
| 0.4704471184172162 | 0.323 |
| 0.32995863316301965 | 0.456 |
| 0.23985516271454457 | 0.452 |
| 0.25160360739392573 | 0.325 |
| 0.3622203755491765 | 0.245 |
| 0.4833684871509396 | 0.267 |
| 0.4109992819499738 | 0.387 |
| 0.28294081651242864 | 0.477 |
| 0.23133783756260645 | 0.405 |
| 0.28640426897564336 | 0.281 |
| 0.42149192301208305 | 0.241 |
| 0.4833497493652375 | 0.305 |
| 0.34778367140812494 | 0.442 |
| 0.24821817474515562 | 0.461 |
| 0.24500245843418794 | 0.344 |
| 0.3426650222196246 | 0.253 |
| 0.471567448973224 | 0.26 |
| 0.43094985056791185 | 0.367 |
| 0.2955737818365368 | 0.475 |
| 0.23066675570188236 | 0.421 |
| 0.2731076165251622 | 0.291 |
| 0.40438198077764437 | 0.239 |
| 0.4906547635671013 | 0.29 |
| 0.36651651365171606 | 0.426 |
| 0.25813178801623043 | 0.469 |
| 0.23967259394659357 | 0.363 |
| 0.3237577278304503 | 0.261 |
| 0.45706644988236905 | 0.254 |
| 0.4497529628656401 | 0.348 |
| 0.30983498255188435 | 0.469 |
| 0.23293970508588982 | 0.436 |
| 0.26221649975985073 | 0.305 |
| 0.3861373040031293 | 0.24 |
| 0.49126828467953165 | 0.278 |
| 0.3860055873011941 | 0.409 |
| 0.26880481153865304 | 0.474 |
| 0.23521073718123653 | 0.382 |
| 0.3060369474227029 | 0.27 |
| 0.4415321827941324 | 0.248 |
| 0.46675608529512924 | 0.328 |
| 0.3258732848234645 | 0.459 |
| 0.23818837551687783 | 0.449 |
| 0.2534300024483551 | 0.321 |
| 0.3669135072588965 | 0.244 |
| 0.48555924117023075 | 0.268 |
| 0.4061406142348447 | 0.391 |
| 0.28010332905954527 | 0.476 |
| 0.23187413738831486 | 0.4 |
| 0.2899508904397643 | 0.278 |
| 0.42544863014583517 | 0.242 |
| 0.4806935423064744 | 0.309 |
| 0.34341382711174373 | 0.446 |
| 0.24603416947592965 | 0.459 |
| 0.24644811544997977 | 0.339 |
| 0.34732103284200866 | 0.251 |
| 0.4747235558544753 | 0.261 |
| 0.42624546100061583 | 0.372 |
| 0.29241230657415307 | 0.476 |
| 0.23057305257116373 | 0.417 |
| 0.27606876205251024 | 0.289 |
| 0.40858162184906693 | 0.239 |
| 0.4895005519571443 | 0.293 |
| 0.3619584624161363 | 0.43 |
| 0.2556661192438224 | 0.467 |
| 0.24086287363702982 | 0.358 |
| 0.3281961657611883 | 0.259 |
| 0.46067991487474 | 0.255 |
| 0.44538392286826434 | 0.352 |
| 0.30625326098411904 | 0.471 |
| 0.23211683059308477 | 0.433 |
| 0.26462219679996035 | 0.301 |
| 0.3906134090868436 | 0.239 |
| 0.49172848707642575 | 0.28 |
| 0.3812646097831202 | 0.413 |
| 0.266195907651954 | 0.473 |
| 0.23620153426053314 | 0.378 |
| 0.3101552409382328 | 0.268 |
| 0.44530604935694795 | 0.249 |
| 0.462893907044829 | 0.333 |
| 0.3218755951396978 | 0.462 |
| 0.23667311522326212 | 0.446 |
| 0.2553606943968507 | 0.317 |
| 0.37158413448986477 | 0.243 |
| 0.4874514705582053 | 0.27 |
| 0.4012816927700266 | 0.395 |
| 0.2773231582750689 | 0.476 |
| 0.23252793593639462 | 0.396 |
| 0.29362594842341694 | 0.276 |
| 0.42936068931510135 | 0.243 |
| 0.47773944844616906 | 0.313 |
| 0.3391000936096612 | 0.449 |
| 0.2439534871769428 | 0.457 |
| 0.2479748554600955 | 0.335 |
| 0.35200531355362863 | 0.249 |
| 0.47769512716883133 | 0.263 |
| 0.4214831683803039 | 0.377 |
| 0.28934031657729836 | 0.476 |
| 0.2306464124634056 | 0.413 |
| 0.2791725627079417 | 0.286 |
| 0.41271609730606207 | 0.24 |
| 0.4879600541668416 | 0.297 |
| 0.3574426805291586 | 0.434 |
| 0.2532486834700968 | 0.466 |
| 0.24210344641378242 | 0.354 |
| 0.33269806845791056 | 0.257 |
| 0.4642233372231134 | 0.256 |
| 0.4409230466058496 | 0.357 |
| 0.30277589097629737 | 0.472 |
| 0.23146869433354414 | 0.429 |
| 0.2671531776042304 | 0.298 |
| 0.39502635666004143 | 0.239 |
| 0.49181153237507963 | 0.283 |
| 0.37656727283096586 | 0.418 |
| 0.26361855949178076 | 0.472 |
| 0.23724512678481455 | 0.373 |
| 0.31435905516698937 | 0.266 |
| 0.44905110785887825 | 0.25 |
| 0.45888428214361887 | 0.337 |
| 0.31797162999276163 | 0.464 |
| 0.23531632642803862 | 0.443 |
| 0.25739925994520413 | 0.313 |
| 0.376221516607923 | 0.241 |
| 0.4890253713108163 | 0.273 |
| 0.3964358521866652 | 0.4 |
| 0.27459294709373877 | 0.476 |
| 0.2332840778857661 | 0.392 |
| 0.2974212034221025 | 0.274 |
| 0.43323348815580787 | 0.245 |
| 0.47451887490084776 | 0.318 |
| 0.3348497838438357 | 0.453 |
| 0.2419901865243742 | 0.455 |
| 0.2495898358526834 | 0.33 |
| 0.3567059355454194 | 0.247 |
| 0.48045121217550735 | 0.264 |
| 0.4166751775432998 | 0.381 |
| 0.2863508118527332 | 0.477 |
| 0.23087851474920043 | 0.409 |
| 0.28241926761647296 | 0.284 |
| 0.41678907558963707 | 0.24 |
| 0.4860454141019243 | 0.3 |
| 0.35296969157378777 | 0.438 |
| 0.25089028289129983 | 0.464 |
| 0.24340035118722003 | 0.349 |
| 0.337257352432944 | 0.255 |
| 0.4676746130148314 | 0.258 |
| 0.4363773050670221 | 0.362 |
| 0.2994016853425816 | 0.474 |
| 0.23099659439599524 | 0.425 |
| 0.2698146798470178 | 0.295 |
| 0.3993729482678996 | 0.239 |
| 0.4915085642606342 | 0.286 |
| 0.37191458755768964 | 0.422 |
| 0.26107274567321836 | 0.47 |
| 0.23833613044533403 | 0.368 |
| 0.3186423272324465 | 0.263 |
| 0.4527641312932423 | 0.252 |
| 0.45474656958864623 | 0.342 |
| 0.31416616529302616 | 0.467 |
| 0.2341234871733798 | 0.44 |
| 0.2595492016963969 | 0.309 |
| 0.38081619085565066 | 0.241 |
| 0.4902637942104515 | 0.275 |
| 0.39161450297945855 | 0.404 |
| 0.27190621036234164 | 0.475 |
| 0.23412787655010492 | 0.387 |
| 0.30132772172112965 | 0.272 |
| 0.43707175289644973 | 0.246 |
| 0.47106377385424536 | 0.322 |
| 0.33067081250218744 | 0.456 |
| 0.24015701446118357 | 0.452 |
| 0.251299196734902 | 0.326 |
| 0.3614104048860278 | 0.246 |
| 0.4829625368482372 | 0.266 |
| 0.4118352720340769 | 0.386 |
| 0.283436029277856 | 0.477 |
| 0.23125839968972584 | 0.405 |
| 0.2858067441225191 | 0.281 |
| 0.4208053273499747 | 0.241 |
| 0.48377511114691946 | 0.304 |
| 0.34854171790928906 | 0.442 |
| 0.24860380476714034 | 0.462 |
| 0.24476101455618815 | 0.344 |
| 0.34186653838003406 | 0.253 |
| 0.47100736492910344 | 0.259 |
| 0.43175370967266574 | 0.367 |
| 0.2961279356158537 | 0.475 |
| 0.23070021492751394 | 0.422 |
| 0.2726117223257837 | 0.292 |
| 0.4036516868743453 | 0.239 |
| 0.49081409248189994 | 0.289 |
| 0.36730609410195125 | 0.426 |
| 0.2585608081811056 | 0.469 |
| 0.23947228189578548 | 0.364 |
| 0.3229998539834056 | 0.261 |
| 0.4564381724617751 | 0.253 |
| 0.45049583048303515 | 0.347 |
| 0.310462590457127 | 0.469 |
| 0.23309895289433266 | 0.437 |
| 0.2618143198780594 | 0.305 |
| 0.38536009771715607 | 0.24 |
| 0.4911517054111895 | 0.277 |
| 0.3868265897472795 | 0.408 |
| 0.26925758968138086 | 0.474 |
| 0.23504594009573146 | 0.383 |
| 0.3053365777689312 | 0.27 |
| 0.4408791603622584 | 0.247 |
| 0.4674049129567437 | 0.327 |
| 0.3265710574679084 | 0.459 |
| 0.23846494958981246 | 0.449 |
| 0.25310801402709426 | 0.321 |
| 0.3661062485250741 | 0.244 |
| 0.48520249973447244 | 0.268 |
| 0.4069780917292282 | 0.39 |
| 0.2805878776906867 | 0.476 |
| 0.23177294347900712 | 0.401 |
| 0.2893304981973861 | 0.279 |
| 0.42477029679966244 | 0.242 |
| 0.48117325031699576 | 0.308 |
| 0.3441628646042933 | 0.445 |
| 0.24640347466977408 | 0.46 |
| 0.24619348479155256 | 0.34 |
| 0.34651654749314537 | 0.251 |
| 0.4741920948028488 | 0.261 |
| 0.4270603870658142 | 0.371 |
| 0.29295041490801893 | 0.476 |
| 0.23057709492545345 | 0.418 |
| 0.2755484768399554 | 0.289 |
| 0.40786282343002583 | 0.239 |
| 0.4897271855652394 | 0.292 |
| 0.3627407161073264 | 0.43 |
| 0.2560877367763561 | 0.468 |
| 0.2406543628708576 | 0.359 |
| 0.32742682126539796 | 0.259 |
| 0.4600618270285236 | 0.255 |
| 0.4461433878479249 | 0.352 |
| 0.3068628798320307 | 0.471 |
| 0.23224619456079124 | 0.433 |
| 0.2641989473166172 | 0.302 |
| 0.3898466415748891 | 0.239 |
| 0.49167580657231036 | 0.28 |
| 0.38207834557101145 | 0.413 |
| 0.26664309436011907 | 0.473 |
| 0.2360268759966035 | 0.378 |
| 0.30943944646307775 | 0.268 |
| 0.444657888994095 | 0.249 |
| 0.463570414026913 | 0.332 |
| 0.32255779978763993 | 0.461 |
| 0.23692304246689877 | 0.446 |
| 0.2550204739965097 | 0.317 |
| 0.3707815513869428 | 0.243 |
| 0.48714765375091046 | 0.27 |
| 0.40211822032822436 | 0.395 |
| 0.27779837678622005 | 0.476 |
| 0.23240757928324107 | 0.397 |
| 0.2929839859626391 | 0.277 |
| 0.4286896512064463 | 0.243 |
| 0.4782682807865646 | 0.313 |
| 0.3398389692735175 | 0.449 |
| 0.2443039622678976 | 0.457 |
| 0.24770571999133106 | 0.335 |
| 0.3511967838447112 | 0.249 |
| 0.47719769249168104 | 0.263 |
| 0.4223072518999198 | 0.376 |
| 0.28986347984257804 | 0.476 |
| 0.23062218816816707 | 0.414 |
| 0.2786276189267342 | 0.286 |
| 0.41200830083462614 | 0.239 |
| 0.48825255335241124 | 0.296 |
| 0.35821765586416177 | 0.434 |
| 0.25366128821236 | 0.466 |
| 0.2418858904576031 | 0.355 |
| 0.33191819063850275 | 0.257 |
| 0.4636187607932651 | 0.256 |
| 0.4416978184647886 | 0.356 |
| 0.3033675746512371 | 0.472 |
| 0.23156782418994898 | 0.43 |
| 0.266707972764526 | 0.299 |
| 0.39427074426485764 | 0.239 |
| 0.4918245378807425 | 0.283 |
| 0.3773733653672727 | 0.417 |
| 0.2640603718890573 | 0.472 |
| 0.2370618425764043 | 0.374 |
| 0.31362898816599805 | 0.266 |
| 0.4484080494041229 | 0.25 |
| 0.4595846880003044 | 0.336 |
| 0.3186373092380578 | 0.464 |
| 0.2355385248550869 | 0.443 |
| 0.2570402081796922 | 0.313 |
| 0.3754253735150734 | 0.242 |
| 0.4887776868490938 | 0.272 |
| 0.3972692505330175 | 0.399 |
| 0.27506004856356403 | 0.476 |
| 0.23314716050320392 | 0.392 |
| 0.2967591599292301 | 0.275 |
| 0.43256885372271836 | 0.244 |
| 0.47509133107137735 | 0.317 |
| 0.33557717683021276 | 0.452 |
| 0.24231948591801356 | 0.455 |
| 0.24930502998651263 | 0.331 |
| 0.35589547305333435 | 0.247 |
| 0.47999305144168836 | 0.264 |
| 0.41750618765322717 | 0.38 |
| 0.28686030189995443 | 0.476 |
| 0.2308276541769033 | 0.41 |
| 0.28184978813935974 | 0.284 |
| 0.41609155942828235 | 0.24 |
| 0.4864012250961313 | 0.3 |
| 0.3537371875429463 | 0.437 |
| 0.25129184779275354 | 0.464 |
| 0.2431725896007377 | 0.35 |
| 0.3364680790357319 | 0.255 |
| 0.4670876856083907 | 0.258 |
| 0.4371662144405149 | 0.361 |
| 0.29997574591637494 | 0.473 |
| 0.23106536695017732 | 0.426 |
| 0.26934661694547696 | 0.295 |
| 0.39862892301731356 | 0.239 |
| 0.4915885734027586 | 0.285 |
| 0.37271298942721365 | 0.421 |
| 0.2615090283204744 | 0.471 |
| 0.23814492675487145 | 0.369 |
| 0.3178989610879734 | 0.264 |
| 0.4521269733808455 | 0.252 |
| 0.4554678535460424 | 0.341 |
| 0.31481459371993364 | 0.466 |
| 0.234317102017555 | 0.44 |
| 0.2591707030192774 | 0.31 |
| 0.380028020312673 | 0.241 |
| 0.49007503133813574 | 0.274 |
| 0.39244297055651467 | 0.403 |
| 0.2723662383962229 | 0.475 |
| 0.23397685807692797 | 0.388 |
| 0.3006471545134905 | 0.272 |
| 0.43641277149981805 | 0.246 |
| 0.4716743878871652 | 0.322 |
| 0.3313853445752708 | 0.455 |
| 0.24046305918574543 | 0.453 |
| 0.2509977402709298 | 0.326 |
| 0.3606001768201753 | 0.246 |
| 0.48254852440598067 | 0.266 |
| 0.4126707495068119 | 0.385 |
| 0.28393321946304667 | 0.477 |
| 0.23118296219157208 | 0.406 |
| 0.2852132691776782 | 0.282 |
| 0.4201172090298598 | 0.241 |
| 0.4841906212696791 | 0.304 |
| 0.3493012181245668 | 0.441 |
| 0.24899199071903716 | 0.462 |
| 0.24452170227501852 | 0.345 |
| 0.34106926995527526 | 0.253 |
| 0.47044289128390915 | 0.259 |
| 0.4325554947214921 | 0.366 |
| 0.2966849490521778 | 0.475 |
| 0.23073882302161752 | 0.422 |
| 0.27211997860516546 | 0.292 |
| 0.40291938233904606 | 0.239 |
| 0.49096175969096634 | 0.289 |
| 0.36809695357865346 | 0.425 |
| 0.2589909752212983 | 0.469 |
| 0.23927332646236693 | 0.365 |
| 0.3222440417658997 | 0.262 |
| 0.4558084114736772 | 0.253 |
| 0.4512356860750051 | 0.346 |
| 0.311093284631032 | 0.468 |
| 0.23326330123355013 | 0.437 |
| 0.26141568578533364 | 0.306 |
| 0.3845811851838155 | 0.24 |
| 0.49102432373602706 | 0.277 |
| 0.3876487760593113 | 0.408 |
| 0.2697113767998438 | 0.474 |
| 0.2348830029739164 | 0.384 |
| 0.3046389960900362 | 0.27 |
| 0.44022529161588186 | 0.247 |
| 0.46804853649367995 | 0.326 |
| 0.32727139995840193 | 0.458 |
| 0.23874598498371108 | 0.45 |
| 0.25278910322361575 | 0.322 |
| 0.36529837772229207 | 0.244 |
| 0.48483700030524157 | 0.268 |
| 0.4078154917671763 | 0.389 |
| 0.2810741659277247 | 0.476 |
| 0.23167531547259546 | 0.402 |
| 0.2887139602893036 | 0.279 |
| 0.4240906100373998 | 0.242 |
| 0.4816439551508419 | 0.308 |
| 0.3449135301353523 | 0.445 |
| 0.2467757734064514 | 0.46 |
| 0.24594122329935397 | 0.341 |
| 0.3457129622171765 | 0.251 |
| 0.47365531679128714 | 0.261 |
| 0.4278735329274855 | 0.37 |
| 0.293491214837251 | 0.475 |
| 0.23058613689778942 | 0.419 |
| 0.27503242285198204 | 0.29 |
| 0.4071420725156463 | 0.239 |
| 0.4899422955684471 | 0.292 |
| 0.36352422320084216 | 0.429 |
| 0.25651073173316363 | 0.468 |
| 0.24044731439765357 | 0.36 |
| 0.32665939038589653 | 0.26 |
| 0.45944177088700844 | 0.254 |
| 0.4469000922732598 | 0.351 |
| 0.30747560110608485 | 0.47 |
| 0.2323807371488111 | 0.434 |
| 0.26377938927031286 | 0.302 |
| 0.38907801689779214 | 0.239 |
| 0.4916119793449888 | 0.279 |
| 0.3828933709930486 | 0.412 |
| 0.26709121944213915 | 0.473 |
| 0.2358538143494719 | 0.379 |
| 0.30872622183550835 | 0.268 |
| 0.4440088873215484 | 0.248 |
| 0.4642424428463759 | 0.331 |
| 0.32324276096924043 | 0.461 |
| 0.23717764493723711 | 0.447 |
| 0.25468343798803433 | 0.318 |
| 0.3699780308598378 | 0.243 |
| 0.48683447707033667 | 0.27 |
| 0.40295507586615364 | 0.394 |
| 0.27827511217889844 | 0.476 |
| 0.23229033677809285 | 0.398 |
| 0.2923456372925946 | 0.277 |
| 0.42801742276718024 | 0.243 |
| 0.47878903833032344 | 0.312 |
| 0.3405796865152738 | 0.448 |
| 0.24465785476570892 | 0.458 |
| 0.24743917146959116 | 0.336 |
| 0.3503888034584186 | 0.249 |
| 0.4766940140021354 | 0.262 |
| 0.4231299086821002 | 0.375 |
| 0.29038913116288445 | 0.476 |
| 0.23060273052669963 | 0.415 |
| 0.27808692614005076 | 0.287 |
| 0.411298654783848 | 0.239 |
| 0.4885338561044241 | 0.295 |
| 0.35899389136452575 | 0.433 |
| 0.2540755796920055 | 0.466 |
| 0.24166996840640514 | 0.355 |
| 0.33114005302586225 | 0.258 |
| 0.46301158292406824 | 0.256 |
| 0.44247003704833116 | 0.355 |
| 0.3039623333026089 | 0.472 |
| 0.23167217902671886 | 0.43 |
| 0.2662666154334993 | 0.299 |
| 0.3935131710940647 | 0.239 |
| 0.4918261175361802 | 0.282 |
| 0.3781807857327195 | 0.416 |
| 0.2645031101109285 | 0.472 |
| 0.23687997903036895 | 0.375 |
| 0.31290130618991563 | 0.266 |
| 0.44776407241228017 | 0.25 |
| 0.46028121296689894 | 0.336 |
| 0.3193058939141512 | 0.464 |
| 0.23576556696646572 | 0.444 |
| 0.25668444333056145 | 0.314 |
| 0.3746280049243145 | 0.242 |
| 0.4885201224640881 | 0.272 |
| 0.39810332818118355 | 0.398 |
| 0.27552846878084136 | 0.476 |
| 0.23301291508034389 | 0.393 |
| 0.29610046534227924 | 0.275 |
| 0.43190317432519015 | 0.244 |
| 0.4756566661372593 | 0.316 |
| 0.33630664618786327 | 0.451 |
| 0.24265259020914698 | 0.456 |
| 0.24902299902377473 | 0.332 |
| 0.3550851892598748 | 0.248 |
| 0.47952776429761756 | 0.264 |
| 0.41833617502870957 | 0.38 |
| 0.2873720515461076 | 0.476 |
| 0.23078124665189556 | 0.411 |
| 0.2812845088225928 | 0.284 |
| 0.41539233153919514 | 0.24 |
| 0.4867463581829989 | 0.299 |
| 0.35450599969045116 | 0.437 |
| 0.2516954744155792 | 0.464 |
| 0.24294667874127093 | 0.351 |
| 0.33568033226761174 | 0.256 |
| 0.46649739102800475 | 0.257 |
| 0.4379527731322584 | 0.36 |
| 0.3005528089488345 | 0.473 |
| 0.23113936581611833 | 0.427 |
| 0.2688825543963309 | 0.296 |
| 0.39788288353713225 | 0.239 |
| 0.4916569711208425 | 0.285 |
| 0.3735127092444017 | 0.42 |
| 0.2619462927710535 | 0.471 |
| 0.2379550606387443 | 0.37 |
| 0.3171578230337618 | 0.264 |
| 0.45148871333099716 | 0.251 |
| 0.45618572368842647 | 0.34 |
| 0.315466035428036 | 0.466 |
| 0.2345156942467957 | 0.441 |
| 0.25879560122758694 | 0.31 |
| 0.37923837757900825 | 0.241 |
| 0.4898759336325911 | 0.274 |
| 0.3932723970387361 | 0.403 |
| 0.2728274193069157 | 0.475 |
| 0.2338281040894233 | 0.389 |
| 0.29996966834369587 | 0.273 |
| 0.4357528615320502 | 0.245 |
| 0.4722788071557181 | 0.321 |
| 0.3321021897331054 | 0.455 |
| 0.24077324479419096 | 0.453 |
| 0.25069921425451214 | 0.327 |
| 0.35978975456859846 | 0.246 |
| 0.4821265794806241 | 0.266 |
| 0.413505638433957 | 0.384 |
| 0.28443242873855035 | 0.477 |
| 0.23111159623667102 | 0.407 |
| 0.2846238719976878 | 0.282 |
| 0.41942753918462705 | 0.241 |
| 0.4845961454138419 | 0.303 |
| 0.3500621470336683 | 0.44 |
| 0.24938265776313745 | 0.463 |
| 0.24428447980170073 | 0.346 |
| 0.3402732668409261 | 0.254 |
| 0.4698741842994705 | 0.259 |
| 0.43335516095049015 | 0.365 |
| 0.297244846951276 | 0.474 |
| 0.23078259758639877 | 0.423 |
| 0.271632366414871 | 0.293 |
| 0.4021850621677492 | 0.239 |
| 0.4910977592161379 | 0.288 |
| 0.36888909809200443 | 0.424 |
| 0.25942225779396405 | 0.47 |
| 0.23907571734701538 | 0.365 |
| 0.32149031546410706 | 0.262 |
| 0.455177235281468 | 0.253 |
| 0.4519724789863896 | 0.345 |
| 0.3117270579810841 | 0.468 |
| 0.233432734065845 | 0.438 |
| 0.2610205740459026 | 0.307 |
| 0.3838005969949078 | 0.24 |
| 0.4908862042390384 | 0.276 |
| 0.3884721202149252 | 0.407 |
| 0.2701661901957248 | 0.474 |
| 0.23472197926856692 | 0.384 |
| 0.30394424321322666 | 0.271 |
| 0.4395705690058825 | 0.247 |
| 0.4686868188798711 | 0.325 |
| 0.3279742767800058 | 0.458 |
| 0.2390314395341105 | 0.45 |
| 0.25247325028842593 | 0.323 |
| 0.3644899541540272 | 0.245 |
| 0.4844628558675885 | 0.267 |
| 0.4086527407413077 | 0.389 |
| 0.28156223396476 | 0.477 |
| 0.231581330204174 | 0.403 |
| 0.28810131414558243 | 0.28 |
| 0.42340954080212445 | 0.242 |
| 0.48210550344259046 | 0.307 |
| 0.34566579043197576 | 0.444 |
| 0.24715099055549333 | 0.46 |
| 0.2456912910660461 | 0.341 |
| 0.34491033423622885 | 0.252 |
| 0.4731133828872478 | 0.26 |
| 0.4286848436639048 | 0.37 |
| 0.2940347380891995 | 0.475 |
| 0.23060021010463463 | 0.419 |
| 0.27452059014013797 | 0.29 |
| 0.40641935567988996 | 0.239 |
| 0.4901458450582482 | 0.291 |
| 0.3643089863973182 | 0.428 |
| 0.2569350585533737 | 0.468 |
| 0.2402417047950569 | 0.361 |
| 0.325893899939848 | 0.26 |
| 0.4588198407197315 | 0.254 |
| 0.44765399708850806 | 0.35 |
| 0.30809142509095294 | 0.47 |
| 0.23252044687870177 | 0.434 |
| 0.2633634965428508 | 0.303 |
| 0.38830755776010045 | 0.239 |
| 0.491537060673116 | 0.279 |
| 0.38370967307721976 | 0.411 |
| 0.2675402912082102 | 0.473 |
| 0.23568238870218963 | 0.38 |
| 0.30801560224191443 | 0.269 |
| 0.4433590486971328 | 0.248 |
| 0.4649098773214557 | 0.33 |
| 0.32393044907094526 | 0.46 |
| 0.23743688931799695 | 0.447 |
| 0.2543495686323607 | 0.319 |
| 0.36917362646957175 | 0.243 |
| 0.4865120379366701 | 0.269 |
| 0.4037921927854737 | 0.393 |
| 0.27875340130831433 | 0.476 |
| 0.23217628630736606 | 0.398 |
| 0.29171094619414367 | 0.277 |
| 0.42734397685329895 | 0.243 |
| 0.47930155779855715 | 0.311 |
| 0.34132220649195627 | 0.448 |
| 0.24501509369082278 | 0.458 |
| 0.24717517431609912 | 0.337 |
| 0.3495814347178021 | 0.25 |
| 0.4761842493288696 | 0.262 |
| 0.4239510738079545 | 0.374 |
| 0.2909173077146775 | 0.476 |
| 0.23058808563823455 | 0.415 |
| 0.2775504858114248 | 0.287 |
| 0.4105871386133899 | 0.239 |
| 0.4888038922178841 | 0.295 |
| 0.3597713827106491 | 0.432 |
| 0.2544914994570424 | 0.466 |
| 0.24145564684773915 | 0.356 |
| 0.3303636880258377 | 0.258 |
| 0.4624019228117528 | 0.256 |
| 0.4432396680478094 | 0.355 |
| 0.3045601748360605 | 0.472 |
| 0.23178175363605893 | 0.431 |
| 0.26582907849542936 | 0.3 |
| 0.3927536514992549 | 0.239 |
| 0.491816313688677 | 0.282 |
| 0.37898953140551916 | 0.415 |
| 0.26494677172470094 | 0.472 |
| 0.23669955991278208 | 0.375 |
| 0.3121760388323551 | 0.267 |
| 0.4471191970854152 | 0.25 |
| 0.46097376359063347 | 0.335 |
| 0.3199773612454431 | 0.463 |
| 0.23599742650661398 | 0.445 |
| 0.2563319474987938 | 0.315 |
| 0.3738294575902743 | 0.242 |
| 0.4882527626412274 | 0.271 |
| 0.3989380293302923 | 0.398 |
| 0.2759982397777107 | 0.476 |
| 0.23288141598751644 | 0.394 |
| 0.29544516608783405 | 0.275 |
| 0.4312364266641625 | 0.244 |
| 0.47621471634324053 | 0.316 |
| 0.3370381507988545 | 0.451 |
| 0.2429894360011957 | 0.456 |
| 0.24874371291563527 | 0.332 |
| 0.35427514867179044 | 0.248 |
| 0.4790554980606593 | 0.264 |
| 0.41916506723578123 | 0.379 |
| 0.28788610138395804 | 0.476 |
| 0.23073935151381694 | 0.411 |
| 0.28072344361663765 | 0.285 |
| 0.41469136620673114 | 0.24 |
| 0.4870807109144795 | 0.298 |
| 0.35527611440730844 | 0.436 |
| 0.2521010943114824 | 0.465 |
| 0.2427225790224224 | 0.351 |
| 0.3348941522245905 | 0.256 |
| 0.465903869438787 | 0.257 |
| 0.4387369449797072 | 0.359 |
| 0.30113289019081746 | 0.473 |
| 0.23121859467339936 | 0.427 |
| 0.26842246685985727 | 0.296 |
| 0.39713483535224525 | 0.239 |
| 0.49171378119520914 | 0.284 |
| 0.3743137510989053 | 0.42 |
| 0.26238452405681595 | 0.471 |
| 0.23776653974745596 | 0.371 |
| 0.31641893860660175 | 0.265 |
| 0.4508493914146633 | 0.251 |
| 0.4569001084018847 | 0.34 |
| 0.31612047481823213 | 0.465 |
| 0.23471924288928478 | 0.441 |
| 0.2584238764289726 | 0.311 |
| 0.3784473021102174 | 0.241 |
| 0.4896665754982434 | 0.274 |
| 0.39410273987610106 | 0.402 |